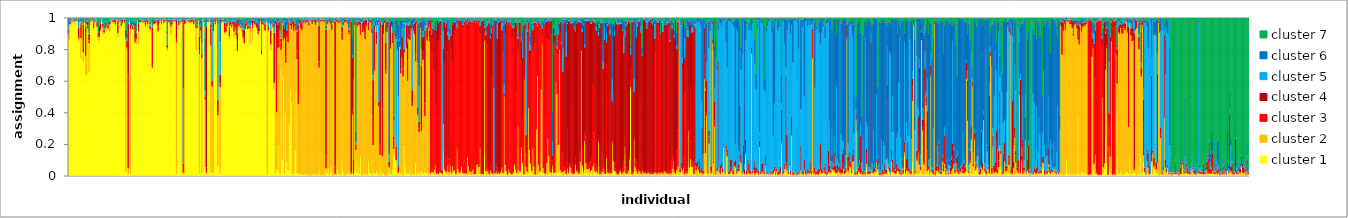
| Category | cluster 1 | cluster 2 | cluster 3 | cluster 4 | cluster 5 | cluster 6 | cluster 7 |
|---|---|---|---|---|---|---|---|
| 0 | 0.867 | 0.032 | 0.01 | 0.013 | 0.027 | 0.042 | 0.009 |
| 1 | 0.857 | 0.104 | 0.008 | 0.008 | 0.007 | 0.008 | 0.008 |
| 2 | 0.946 | 0.017 | 0.005 | 0.009 | 0.01 | 0.008 | 0.005 |
| 3 | 0.971 | 0.006 | 0.005 | 0.004 | 0.005 | 0.005 | 0.003 |
| 4 | 0.972 | 0.009 | 0.004 | 0.004 | 0.003 | 0.004 | 0.004 |
| 5 | 0.969 | 0.005 | 0.004 | 0.006 | 0.005 | 0.005 | 0.005 |
| 6 | 0.97 | 0.009 | 0.006 | 0.005 | 0.003 | 0.004 | 0.003 |
| 7 | 0.978 | 0.004 | 0.004 | 0.005 | 0.004 | 0.003 | 0.003 |
| 8 | 0.971 | 0.009 | 0.004 | 0.004 | 0.005 | 0.003 | 0.003 |
| 9 | 0.848 | 0.019 | 0.011 | 0.057 | 0.031 | 0.027 | 0.008 |
| 10 | 0.974 | 0.007 | 0.005 | 0.004 | 0.004 | 0.004 | 0.003 |
| 11 | 0.74 | 0.131 | 0.076 | 0.012 | 0.018 | 0.016 | 0.009 |
| 12 | 0.954 | 0.01 | 0.006 | 0.006 | 0.009 | 0.008 | 0.008 |
| 13 | 0.716 | 0.064 | 0.069 | 0.109 | 0.014 | 0.011 | 0.017 |
| 14 | 0.966 | 0.014 | 0.004 | 0.003 | 0.003 | 0.006 | 0.005 |
| 15 | 0.642 | 0.118 | 0.139 | 0.043 | 0.024 | 0.022 | 0.013 |
| 16 | 0.637 | 0.323 | 0.008 | 0.007 | 0.009 | 0.01 | 0.005 |
| 17 | 0.902 | 0.029 | 0.019 | 0.027 | 0.006 | 0.009 | 0.009 |
| 18 | 0.654 | 0.184 | 0.019 | 0.04 | 0.007 | 0.011 | 0.086 |
| 19 | 0.95 | 0.028 | 0.005 | 0.004 | 0.004 | 0.006 | 0.003 |
| 20 | 0.975 | 0.007 | 0.004 | 0.004 | 0.004 | 0.004 | 0.003 |
| 21 | 0.975 | 0.009 | 0.005 | 0.003 | 0.003 | 0.003 | 0.002 |
| 22 | 0.922 | 0.013 | 0.018 | 0.012 | 0.02 | 0.008 | 0.006 |
| 23 | 0.964 | 0.006 | 0.008 | 0.006 | 0.005 | 0.005 | 0.007 |
| 24 | 0.979 | 0.006 | 0.003 | 0.004 | 0.003 | 0.003 | 0.003 |
| 25 | 0.935 | 0.009 | 0.027 | 0.009 | 0.007 | 0.006 | 0.008 |
| 26 | 0.859 | 0.02 | 0.013 | 0.015 | 0.007 | 0.018 | 0.068 |
| 27 | 0.839 | 0.04 | 0.025 | 0.043 | 0.039 | 0.008 | 0.006 |
| 28 | 0.909 | 0.015 | 0.04 | 0.006 | 0.006 | 0.008 | 0.016 |
| 29 | 0.979 | 0.004 | 0.004 | 0.003 | 0.003 | 0.003 | 0.003 |
| 30 | 0.89 | 0.052 | 0.012 | 0.008 | 0.014 | 0.013 | 0.011 |
| 31 | 0.899 | 0.008 | 0.011 | 0.008 | 0.006 | 0.009 | 0.06 |
| 32 | 0.918 | 0.017 | 0.023 | 0.012 | 0.012 | 0.01 | 0.008 |
| 33 | 0.912 | 0.037 | 0.009 | 0.007 | 0.019 | 0.009 | 0.006 |
| 34 | 0.924 | 0.012 | 0.008 | 0.007 | 0.004 | 0.006 | 0.038 |
| 35 | 0.923 | 0.013 | 0.008 | 0.007 | 0.004 | 0.006 | 0.039 |
| 36 | 0.91 | 0.044 | 0.005 | 0.02 | 0.013 | 0.004 | 0.004 |
| 37 | 0.981 | 0.005 | 0.003 | 0.004 | 0.003 | 0.003 | 0.002 |
| 38 | 0.962 | 0.013 | 0.007 | 0.007 | 0.004 | 0.004 | 0.003 |
| 39 | 0.968 | 0.008 | 0.006 | 0.005 | 0.005 | 0.004 | 0.004 |
| 40 | 0.963 | 0.008 | 0.01 | 0.006 | 0.005 | 0.005 | 0.004 |
| 41 | 0.95 | 0.008 | 0.013 | 0.009 | 0.007 | 0.006 | 0.007 |
| 42 | 0.978 | 0.005 | 0.004 | 0.003 | 0.003 | 0.003 | 0.004 |
| 43 | 0.878 | 0.024 | 0.054 | 0.02 | 0.006 | 0.006 | 0.011 |
| 44 | 0.968 | 0.004 | 0.006 | 0.004 | 0.004 | 0.005 | 0.01 |
| 45 | 0.973 | 0.006 | 0.005 | 0.005 | 0.003 | 0.004 | 0.004 |
| 46 | 0.938 | 0.012 | 0.013 | 0.008 | 0.011 | 0.01 | 0.007 |
| 47 | 0.956 | 0.011 | 0.006 | 0.014 | 0.005 | 0.005 | 0.003 |
| 48 | 0.978 | 0.006 | 0.003 | 0.004 | 0.003 | 0.003 | 0.003 |
| 49 | 0.961 | 0.012 | 0.008 | 0.007 | 0.003 | 0.004 | 0.004 |
| 50 | 0.024 | 0.843 | 0.017 | 0.037 | 0.059 | 0.007 | 0.013 |
| 51 | 0.798 | 0.012 | 0.033 | 0.011 | 0.021 | 0.024 | 0.101 |
| 52 | 0.01 | 0.036 | 0.586 | 0.33 | 0.012 | 0.018 | 0.008 |
| 53 | 0.975 | 0.008 | 0.003 | 0.004 | 0.004 | 0.004 | 0.003 |
| 54 | 0.013 | 0.917 | 0.017 | 0.008 | 0.009 | 0.017 | 0.019 |
| 55 | 0.941 | 0.008 | 0.01 | 0.011 | 0.012 | 0.009 | 0.009 |
| 56 | 0.921 | 0.006 | 0.008 | 0.011 | 0.015 | 0.017 | 0.022 |
| 57 | 0.948 | 0.005 | 0.022 | 0.008 | 0.006 | 0.003 | 0.007 |
| 58 | 0.833 | 0.011 | 0.023 | 0.101 | 0.007 | 0.006 | 0.02 |
| 59 | 0.834 | 0.032 | 0.02 | 0.013 | 0.007 | 0.007 | 0.086 |
| 60 | 0.974 | 0.004 | 0.003 | 0.004 | 0.005 | 0.005 | 0.005 |
| 61 | 0.831 | 0.085 | 0.021 | 0.028 | 0.01 | 0.012 | 0.012 |
| 62 | 0.965 | 0.005 | 0.008 | 0.009 | 0.004 | 0.005 | 0.005 |
| 63 | 0.965 | 0.009 | 0.007 | 0.009 | 0.003 | 0.004 | 0.003 |
| 64 | 0.971 | 0.005 | 0.003 | 0.004 | 0.007 | 0.006 | 0.004 |
| 65 | 0.966 | 0.005 | 0.006 | 0.004 | 0.004 | 0.005 | 0.01 |
| 66 | 0.965 | 0.008 | 0.007 | 0.005 | 0.004 | 0.006 | 0.006 |
| 67 | 0.935 | 0.014 | 0.009 | 0.01 | 0.005 | 0.008 | 0.019 |
| 68 | 0.967 | 0.004 | 0.005 | 0.007 | 0.005 | 0.008 | 0.004 |
| 69 | 0.93 | 0.031 | 0.007 | 0.012 | 0.007 | 0.005 | 0.007 |
| 70 | 0.974 | 0.005 | 0.004 | 0.005 | 0.003 | 0.004 | 0.006 |
| 71 | 0.906 | 0.021 | 0.017 | 0.007 | 0.009 | 0.015 | 0.024 |
| 72 | 0.968 | 0.008 | 0.005 | 0.004 | 0.004 | 0.004 | 0.007 |
| 73 | 0.675 | 0.011 | 0.229 | 0.023 | 0.012 | 0.01 | 0.039 |
| 74 | 0.948 | 0.014 | 0.015 | 0.008 | 0.005 | 0.006 | 0.004 |
| 75 | 0.958 | 0.006 | 0.013 | 0.006 | 0.008 | 0.005 | 0.004 |
| 76 | 0.957 | 0.01 | 0.009 | 0.007 | 0.005 | 0.005 | 0.008 |
| 77 | 0.966 | 0.011 | 0.006 | 0.004 | 0.003 | 0.005 | 0.005 |
| 78 | 0.907 | 0.011 | 0.028 | 0.039 | 0.004 | 0.004 | 0.008 |
| 79 | 0.961 | 0.008 | 0.004 | 0.005 | 0.004 | 0.004 | 0.013 |
| 80 | 0.974 | 0.008 | 0.003 | 0.004 | 0.003 | 0.003 | 0.004 |
| 81 | 0.955 | 0.006 | 0.004 | 0.009 | 0.007 | 0.009 | 0.01 |
| 82 | 0.981 | 0.004 | 0.003 | 0.004 | 0.002 | 0.003 | 0.003 |
| 83 | 0.962 | 0.007 | 0.009 | 0.008 | 0.004 | 0.005 | 0.005 |
| 84 | 0.971 | 0.006 | 0.006 | 0.004 | 0.005 | 0.005 | 0.004 |
| 85 | 0.972 | 0.005 | 0.003 | 0.005 | 0.002 | 0.005 | 0.008 |
| 86 | 0.787 | 0.018 | 0.008 | 0.014 | 0.072 | 0.02 | 0.081 |
| 87 | 0.97 | 0.004 | 0.006 | 0.005 | 0.003 | 0.004 | 0.007 |
| 88 | 0.962 | 0.008 | 0.012 | 0.006 | 0.005 | 0.004 | 0.004 |
| 89 | 0.892 | 0.054 | 0.01 | 0.011 | 0.012 | 0.011 | 0.011 |
| 90 | 0.935 | 0.023 | 0.013 | 0.014 | 0.003 | 0.004 | 0.008 |
| 91 | 0.975 | 0.004 | 0.005 | 0.004 | 0.004 | 0.004 | 0.006 |
| 92 | 0.97 | 0.006 | 0.006 | 0.004 | 0.004 | 0.005 | 0.004 |
| 93 | 0.973 | 0.006 | 0.004 | 0.005 | 0.004 | 0.004 | 0.004 |
| 94 | 0.013 | 0.831 | 0.019 | 0.121 | 0.007 | 0.006 | 0.004 |
| 95 | 0.973 | 0.003 | 0.005 | 0.004 | 0.004 | 0.005 | 0.006 |
| 96 | 0.926 | 0.028 | 0.008 | 0.014 | 0.007 | 0.007 | 0.01 |
| 97 | 0.962 | 0.007 | 0.005 | 0.006 | 0.006 | 0.005 | 0.009 |
| 98 | 0.975 | 0.004 | 0.005 | 0.004 | 0.004 | 0.004 | 0.004 |
| 99 | 0.007 | 0.964 | 0.009 | 0.009 | 0.004 | 0.005 | 0.003 |
| 100 | 0.008 | 0.012 | 0.039 | 0.015 | 0.479 | 0.417 | 0.03 |
| 101 | 0.017 | 0.945 | 0.007 | 0.018 | 0.005 | 0.005 | 0.003 |
| 102 | 0.96 | 0.005 | 0.009 | 0.005 | 0.003 | 0.004 | 0.014 |
| 103 | 0.975 | 0.006 | 0.004 | 0.005 | 0.004 | 0.003 | 0.004 |
| 104 | 0.97 | 0.007 | 0.005 | 0.005 | 0.004 | 0.004 | 0.005 |
| 105 | 0.966 | 0.005 | 0.004 | 0.005 | 0.005 | 0.006 | 0.008 |
| 106 | 0.966 | 0.007 | 0.008 | 0.006 | 0.004 | 0.004 | 0.006 |
| 107 | 0.964 | 0.009 | 0.004 | 0.008 | 0.006 | 0.005 | 0.005 |
| 108 | 0.971 | 0.006 | 0.009 | 0.004 | 0.004 | 0.003 | 0.003 |
| 109 | 0.953 | 0.007 | 0.01 | 0.011 | 0.007 | 0.006 | 0.006 |
| 110 | 0.968 | 0.008 | 0.007 | 0.004 | 0.004 | 0.005 | 0.005 |
| 111 | 0.8 | 0.136 | 0.009 | 0.014 | 0.007 | 0.012 | 0.023 |
| 112 | 0.929 | 0.007 | 0.009 | 0.006 | 0.008 | 0.018 | 0.022 |
| 113 | 0.979 | 0.004 | 0.002 | 0.003 | 0.003 | 0.005 | 0.004 |
| 114 | 0.012 | 0.757 | 0.023 | 0.09 | 0.072 | 0.022 | 0.025 |
| 115 | 0.864 | 0.055 | 0.012 | 0.011 | 0.022 | 0.021 | 0.014 |
| 116 | 0.015 | 0.729 | 0.022 | 0.009 | 0.065 | 0.145 | 0.016 |
| 117 | 0.984 | 0.003 | 0.003 | 0.003 | 0.002 | 0.002 | 0.002 |
| 118 | 0.965 | 0.008 | 0.01 | 0.005 | 0.003 | 0.004 | 0.005 |
| 119 | 0.052 | 0.429 | 0.01 | 0.009 | 0.038 | 0.339 | 0.123 |
| 120 | 0.008 | 0.012 | 0.032 | 0.894 | 0.025 | 0.024 | 0.007 |
| 121 | 0.971 | 0.006 | 0.005 | 0.005 | 0.004 | 0.004 | 0.004 |
| 122 | 0.967 | 0.006 | 0.004 | 0.004 | 0.008 | 0.005 | 0.006 |
| 123 | 0.976 | 0.004 | 0.004 | 0.003 | 0.004 | 0.004 | 0.005 |
| 124 | 0.022 | 0.801 | 0.117 | 0.018 | 0.014 | 0.013 | 0.014 |
| 125 | 0.02 | 0.543 | 0.008 | 0.028 | 0.373 | 0.016 | 0.011 |
| 126 | 0.015 | 0.901 | 0.02 | 0.036 | 0.008 | 0.008 | 0.013 |
| 127 | 0.961 | 0.013 | 0.005 | 0.009 | 0.004 | 0.004 | 0.004 |
| 128 | 0.949 | 0.012 | 0.007 | 0.006 | 0.009 | 0.01 | 0.008 |
| 129 | 0.978 | 0.004 | 0.006 | 0.004 | 0.003 | 0.003 | 0.003 |
| 130 | 0.059 | 0.323 | 0.018 | 0.079 | 0.482 | 0.03 | 0.009 |
| 131 | 0.55 | 0.424 | 0.006 | 0.004 | 0.004 | 0.004 | 0.008 |
| 132 | 0.011 | 0.551 | 0.024 | 0.055 | 0.205 | 0.151 | 0.004 |
| 133 | 0.963 | 0.008 | 0.007 | 0.008 | 0.005 | 0.005 | 0.004 |
| 134 | 0.975 | 0.003 | 0.004 | 0.005 | 0.004 | 0.005 | 0.006 |
| 135 | 0.967 | 0.01 | 0.005 | 0.006 | 0.004 | 0.004 | 0.003 |
| 136 | 0.89 | 0.017 | 0.041 | 0.02 | 0.009 | 0.014 | 0.01 |
| 137 | 0.905 | 0.008 | 0.044 | 0.006 | 0.006 | 0.008 | 0.023 |
| 138 | 0.942 | 0.008 | 0.011 | 0.011 | 0.013 | 0.005 | 0.01 |
| 139 | 0.968 | 0.005 | 0.007 | 0.004 | 0.004 | 0.004 | 0.008 |
| 140 | 0.863 | 0.018 | 0.053 | 0.009 | 0.005 | 0.024 | 0.028 |
| 141 | 0.949 | 0.007 | 0.011 | 0.009 | 0.008 | 0.008 | 0.007 |
| 142 | 0.931 | 0.008 | 0.007 | 0.011 | 0.033 | 0.006 | 0.003 |
| 143 | 0.946 | 0.011 | 0.017 | 0.007 | 0.007 | 0.006 | 0.006 |
| 144 | 0.879 | 0.033 | 0.051 | 0.012 | 0.009 | 0.008 | 0.009 |
| 145 | 0.938 | 0.007 | 0.014 | 0.013 | 0.009 | 0.006 | 0.013 |
| 146 | 0.867 | 0.022 | 0.027 | 0.049 | 0.009 | 0.013 | 0.014 |
| 147 | 0.783 | 0.008 | 0.054 | 0.057 | 0.038 | 0.05 | 0.011 |
| 148 | 0.919 | 0.033 | 0.016 | 0.016 | 0.004 | 0.006 | 0.006 |
| 149 | 0.938 | 0.007 | 0.007 | 0.007 | 0.015 | 0.018 | 0.008 |
| 150 | 0.918 | 0.017 | 0.006 | 0.006 | 0.013 | 0.027 | 0.012 |
| 151 | 0.908 | 0.03 | 0.013 | 0.017 | 0.006 | 0.012 | 0.014 |
| 152 | 0.845 | 0.029 | 0.017 | 0.031 | 0.028 | 0.02 | 0.032 |
| 153 | 0.832 | 0.006 | 0.043 | 0.041 | 0.013 | 0.015 | 0.048 |
| 154 | 0.925 | 0.003 | 0.016 | 0.017 | 0.017 | 0.011 | 0.01 |
| 155 | 0.937 | 0.017 | 0.008 | 0.012 | 0.009 | 0.01 | 0.007 |
| 156 | 0.923 | 0.006 | 0.019 | 0.006 | 0.009 | 0.01 | 0.026 |
| 157 | 0.93 | 0.005 | 0.006 | 0.008 | 0.014 | 0.019 | 0.018 |
| 158 | 0.833 | 0.097 | 0.008 | 0.006 | 0.012 | 0.035 | 0.009 |
| 159 | 0.966 | 0.005 | 0.004 | 0.008 | 0.007 | 0.006 | 0.004 |
| 160 | 0.854 | 0.081 | 0.016 | 0.032 | 0.006 | 0.008 | 0.004 |
| 161 | 0.964 | 0.005 | 0.006 | 0.006 | 0.006 | 0.007 | 0.006 |
| 162 | 0.955 | 0.006 | 0.011 | 0.009 | 0.007 | 0.008 | 0.004 |
| 163 | 0.937 | 0.016 | 0.006 | 0.006 | 0.016 | 0.012 | 0.006 |
| 164 | 0.927 | 0.008 | 0.006 | 0.035 | 0.009 | 0.007 | 0.008 |
| 165 | 0.884 | 0.014 | 0.015 | 0.047 | 0.015 | 0.02 | 0.005 |
| 166 | 0.908 | 0.007 | 0.01 | 0.009 | 0.026 | 0.035 | 0.005 |
| 167 | 0.974 | 0.007 | 0.004 | 0.005 | 0.004 | 0.004 | 0.003 |
| 168 | 0.763 | 0.006 | 0.021 | 0.006 | 0.164 | 0.034 | 0.007 |
| 169 | 0.952 | 0.007 | 0.006 | 0.01 | 0.01 | 0.007 | 0.007 |
| 170 | 0.925 | 0.028 | 0.004 | 0.008 | 0.011 | 0.018 | 0.006 |
| 171 | 0.912 | 0.007 | 0.027 | 0.012 | 0.018 | 0.013 | 0.011 |
| 172 | 0.973 | 0.004 | 0.005 | 0.004 | 0.005 | 0.005 | 0.005 |
| 173 | 0.006 | 0.96 | 0.007 | 0.005 | 0.009 | 0.008 | 0.006 |
| 174 | 0.91 | 0.011 | 0.015 | 0.01 | 0.034 | 0.014 | 0.006 |
| 175 | 0.96 | 0.01 | 0.005 | 0.007 | 0.007 | 0.007 | 0.005 |
| 176 | 0.796 | 0.035 | 0.048 | 0.038 | 0.039 | 0.03 | 0.014 |
| 177 | 0.959 | 0.005 | 0.005 | 0.009 | 0.008 | 0.007 | 0.007 |
| 178 | 0.928 | 0.013 | 0.009 | 0.01 | 0.012 | 0.022 | 0.006 |
| 179 | 0.544 | 0.042 | 0.006 | 0.313 | 0.034 | 0.04 | 0.021 |
| 180 | 0.015 | 0.949 | 0.008 | 0.01 | 0.008 | 0.007 | 0.004 |
| 181 | 0.042 | 0.361 | 0.53 | 0.042 | 0.006 | 0.01 | 0.009 |
| 182 | 0.033 | 0.774 | 0.07 | 0.081 | 0.017 | 0.019 | 0.006 |
| 183 | 0.198 | 0.617 | 0.152 | 0.008 | 0.005 | 0.016 | 0.004 |
| 184 | 0.011 | 0.911 | 0.051 | 0.009 | 0.006 | 0.007 | 0.005 |
| 185 | 0.671 | 0.126 | 0.047 | 0.023 | 0.031 | 0.011 | 0.09 |
| 186 | 0.097 | 0.868 | 0.006 | 0.006 | 0.005 | 0.01 | 0.008 |
| 187 | 0.623 | 0.233 | 0.016 | 0.081 | 0.026 | 0.017 | 0.004 |
| 188 | 0.015 | 0.857 | 0.034 | 0.025 | 0.052 | 0.012 | 0.005 |
| 189 | 0.403 | 0.31 | 0.04 | 0.221 | 0.008 | 0.014 | 0.004 |
| 190 | 0.087 | 0.792 | 0.017 | 0.021 | 0.039 | 0.037 | 0.006 |
| 191 | 0.034 | 0.811 | 0.124 | 0.008 | 0.007 | 0.009 | 0.006 |
| 192 | 0.321 | 0.654 | 0.009 | 0.005 | 0.004 | 0.004 | 0.004 |
| 193 | 0.548 | 0.405 | 0.009 | 0.009 | 0.011 | 0.008 | 0.01 |
| 194 | 0.462 | 0.466 | 0.015 | 0.022 | 0.012 | 0.018 | 0.007 |
| 195 | 0.013 | 0.948 | 0.012 | 0.01 | 0.008 | 0.006 | 0.004 |
| 196 | 0.012 | 0.904 | 0.013 | 0.048 | 0.009 | 0.009 | 0.006 |
| 197 | 0.158 | 0.791 | 0.009 | 0.006 | 0.006 | 0.007 | 0.023 |
| 198 | 0.526 | 0.393 | 0.028 | 0.012 | 0.011 | 0.015 | 0.015 |
| 199 | 0.013 | 0.724 | 0.058 | 0.118 | 0.019 | 0.062 | 0.006 |
| 200 | 0.017 | 0.435 | 0.49 | 0.012 | 0.007 | 0.011 | 0.028 |
| 201 | 0.008 | 0.957 | 0.01 | 0.012 | 0.005 | 0.005 | 0.004 |
| 202 | 0.009 | 0.927 | 0.038 | 0.011 | 0.005 | 0.005 | 0.005 |
| 203 | 0.008 | 0.913 | 0.033 | 0.013 | 0.015 | 0.01 | 0.008 |
| 204 | 0.007 | 0.957 | 0.007 | 0.014 | 0.005 | 0.005 | 0.006 |
| 205 | 0.005 | 0.972 | 0.005 | 0.007 | 0.004 | 0.004 | 0.003 |
| 206 | 0.018 | 0.946 | 0.006 | 0.009 | 0.008 | 0.007 | 0.006 |
| 207 | 0.007 | 0.965 | 0.01 | 0.006 | 0.005 | 0.004 | 0.003 |
| 208 | 0.006 | 0.968 | 0.007 | 0.007 | 0.004 | 0.005 | 0.004 |
| 209 | 0.005 | 0.946 | 0.01 | 0.01 | 0.02 | 0.005 | 0.004 |
| 210 | 0.005 | 0.974 | 0.004 | 0.005 | 0.005 | 0.004 | 0.003 |
| 211 | 0.003 | 0.978 | 0.006 | 0.004 | 0.003 | 0.003 | 0.002 |
| 212 | 0.006 | 0.956 | 0.017 | 0.008 | 0.005 | 0.004 | 0.005 |
| 213 | 0.012 | 0.968 | 0.005 | 0.005 | 0.004 | 0.003 | 0.003 |
| 214 | 0.006 | 0.969 | 0.005 | 0.006 | 0.007 | 0.004 | 0.003 |
| 215 | 0.008 | 0.947 | 0.025 | 0.009 | 0.004 | 0.004 | 0.003 |
| 216 | 0.004 | 0.97 | 0.007 | 0.008 | 0.004 | 0.004 | 0.003 |
| 217 | 0.006 | 0.974 | 0.004 | 0.006 | 0.005 | 0.003 | 0.002 |
| 218 | 0.037 | 0.647 | 0.04 | 0.226 | 0.006 | 0.007 | 0.037 |
| 219 | 0.005 | 0.97 | 0.007 | 0.006 | 0.004 | 0.004 | 0.003 |
| 220 | 0.004 | 0.974 | 0.004 | 0.006 | 0.006 | 0.003 | 0.003 |
| 221 | 0.007 | 0.974 | 0.006 | 0.004 | 0.003 | 0.003 | 0.002 |
| 222 | 0.005 | 0.969 | 0.004 | 0.009 | 0.005 | 0.005 | 0.004 |
| 223 | 0.005 | 0.967 | 0.007 | 0.005 | 0.006 | 0.005 | 0.005 |
| 224 | 0.034 | 0.014 | 0.079 | 0.797 | 0.006 | 0.021 | 0.047 |
| 225 | 0.013 | 0.949 | 0.011 | 0.012 | 0.007 | 0.004 | 0.004 |
| 226 | 0.044 | 0.928 | 0.007 | 0.004 | 0.008 | 0.005 | 0.006 |
| 227 | 0.004 | 0.969 | 0.005 | 0.012 | 0.004 | 0.004 | 0.003 |
| 228 | 0.025 | 0.936 | 0.006 | 0.01 | 0.007 | 0.008 | 0.007 |
| 229 | 0.055 | 0.867 | 0.007 | 0.03 | 0.006 | 0.017 | 0.019 |
| 230 | 0.003 | 0.972 | 0.005 | 0.009 | 0.004 | 0.004 | 0.003 |
| 231 | 0.008 | 0.957 | 0.011 | 0.006 | 0.006 | 0.006 | 0.007 |
| 232 | 0.005 | 0.009 | 0.044 | 0.918 | 0.006 | 0.012 | 0.005 |
| 233 | 0.004 | 0.972 | 0.009 | 0.006 | 0.004 | 0.003 | 0.003 |
| 234 | 0.036 | 0.939 | 0.007 | 0.005 | 0.006 | 0.004 | 0.003 |
| 235 | 0.008 | 0.958 | 0.008 | 0.006 | 0.005 | 0.006 | 0.009 |
| 236 | 0.006 | 0.964 | 0.007 | 0.007 | 0.007 | 0.005 | 0.004 |
| 237 | 0.01 | 0.963 | 0.005 | 0.008 | 0.006 | 0.005 | 0.003 |
| 238 | 0.089 | 0.771 | 0.046 | 0.035 | 0.022 | 0.013 | 0.025 |
| 239 | 0.024 | 0.93 | 0.007 | 0.011 | 0.011 | 0.013 | 0.004 |
| 240 | 0.004 | 0.966 | 0.005 | 0.012 | 0.006 | 0.005 | 0.003 |
| 241 | 0.005 | 0.967 | 0.005 | 0.008 | 0.005 | 0.007 | 0.004 |
| 242 | 0.004 | 0.969 | 0.006 | 0.007 | 0.005 | 0.004 | 0.005 |
| 243 | 0.012 | 0.951 | 0.013 | 0.004 | 0.008 | 0.007 | 0.006 |
| 244 | 0.018 | 0.878 | 0.012 | 0.013 | 0.012 | 0.062 | 0.005 |
| 245 | 0.006 | 0.962 | 0.009 | 0.006 | 0.006 | 0.005 | 0.005 |
| 246 | 0.006 | 0.008 | 0.009 | 0.952 | 0.004 | 0.009 | 0.011 |
| 247 | 0.014 | 0.373 | 0.03 | 0.332 | 0.014 | 0.107 | 0.13 |
| 248 | 0.005 | 0.007 | 0.068 | 0.019 | 0.513 | 0.316 | 0.072 |
| 249 | 0.03 | 0.924 | 0.018 | 0.007 | 0.009 | 0.009 | 0.003 |
| 250 | 0.092 | 0.072 | 0.02 | 0.011 | 0.019 | 0.072 | 0.714 |
| 251 | 0.016 | 0.929 | 0.022 | 0.008 | 0.009 | 0.007 | 0.009 |
| 252 | 0.066 | 0.887 | 0.014 | 0.008 | 0.008 | 0.011 | 0.007 |
| 253 | 0.012 | 0.944 | 0.019 | 0.007 | 0.008 | 0.007 | 0.004 |
| 254 | 0.121 | 0.771 | 0.063 | 0.017 | 0.008 | 0.015 | 0.006 |
| 255 | 0.005 | 0.968 | 0.006 | 0.009 | 0.004 | 0.004 | 0.003 |
| 256 | 0.005 | 0.904 | 0.022 | 0.038 | 0.007 | 0.009 | 0.015 |
| 257 | 0.012 | 0.907 | 0.03 | 0.033 | 0.005 | 0.008 | 0.005 |
| 258 | 0.007 | 0.857 | 0.116 | 0.008 | 0.004 | 0.005 | 0.003 |
| 259 | 0.008 | 0.94 | 0.012 | 0.026 | 0.006 | 0.004 | 0.004 |
| 260 | 0.005 | 0.977 | 0.004 | 0.004 | 0.003 | 0.004 | 0.003 |
| 261 | 0.093 | 0.829 | 0.03 | 0.02 | 0.009 | 0.011 | 0.007 |
| 262 | 0.016 | 0.954 | 0.014 | 0.005 | 0.005 | 0.004 | 0.003 |
| 263 | 0.016 | 0.955 | 0.012 | 0.005 | 0.004 | 0.004 | 0.003 |
| 264 | 0.007 | 0.897 | 0.015 | 0.01 | 0.021 | 0.044 | 0.006 |
| 265 | 0.023 | 0.171 | 0.19 | 0.221 | 0.031 | 0.295 | 0.07 |
| 266 | 0.016 | 0.65 | 0.261 | 0.023 | 0.024 | 0.021 | 0.006 |
| 267 | 0.009 | 0.938 | 0.013 | 0.023 | 0.008 | 0.005 | 0.004 |
| 268 | 0.031 | 0.804 | 0.027 | 0.048 | 0.061 | 0.02 | 0.009 |
| 269 | 0.01 | 0.942 | 0.021 | 0.011 | 0.006 | 0.004 | 0.005 |
| 270 | 0.004 | 0.434 | 0.008 | 0.02 | 0.505 | 0.02 | 0.01 |
| 271 | 0.037 | 0.095 | 0.067 | 0.773 | 0.009 | 0.008 | 0.011 |
| 272 | 0.005 | 0.971 | 0.005 | 0.007 | 0.004 | 0.005 | 0.003 |
| 273 | 0.021 | 0.102 | 0.306 | 0.527 | 0.011 | 0.01 | 0.023 |
| 274 | 0.014 | 0.882 | 0.022 | 0.054 | 0.013 | 0.01 | 0.005 |
| 275 | 0.005 | 0.961 | 0.007 | 0.011 | 0.007 | 0.006 | 0.004 |
| 276 | 0.007 | 0.639 | 0.021 | 0.174 | 0.07 | 0.05 | 0.04 |
| 277 | 0.004 | 0.907 | 0.014 | 0.053 | 0.008 | 0.008 | 0.006 |
| 278 | 0.016 | 0.926 | 0.014 | 0.019 | 0.007 | 0.007 | 0.01 |
| 279 | 0.045 | 0.007 | 0.01 | 0.026 | 0.046 | 0.822 | 0.044 |
| 280 | 0.008 | 0.796 | 0.019 | 0.147 | 0.006 | 0.015 | 0.01 |
| 281 | 0.007 | 0.938 | 0.011 | 0.024 | 0.009 | 0.006 | 0.005 |
| 282 | 0.035 | 0.805 | 0.053 | 0.013 | 0.026 | 0.057 | 0.011 |
| 283 | 0.13 | 0.039 | 0.057 | 0.024 | 0.098 | 0.033 | 0.619 |
| 284 | 0.242 | 0.64 | 0.027 | 0.01 | 0.036 | 0.033 | 0.012 |
| 285 | 0.085 | 0.014 | 0.072 | 0.014 | 0.678 | 0.121 | 0.016 |
| 286 | 0.009 | 0.792 | 0.008 | 0.044 | 0.033 | 0.107 | 0.007 |
| 287 | 0.015 | 0.005 | 0.033 | 0.01 | 0.441 | 0.452 | 0.045 |
| 288 | 0.033 | 0.784 | 0.014 | 0.019 | 0.02 | 0.019 | 0.111 |
| 289 | 0.011 | 0.636 | 0.025 | 0.131 | 0.02 | 0.163 | 0.015 |
| 290 | 0.013 | 0.735 | 0.052 | 0.077 | 0.048 | 0.061 | 0.013 |
| 291 | 0.004 | 0.624 | 0.055 | 0.243 | 0.038 | 0.027 | 0.009 |
| 292 | 0.196 | 0.582 | 0.009 | 0.012 | 0.131 | 0.032 | 0.038 |
| 293 | 0.055 | 0.911 | 0.008 | 0.009 | 0.004 | 0.005 | 0.008 |
| 294 | 0.015 | 0.79 | 0.029 | 0.123 | 0.016 | 0.013 | 0.015 |
| 295 | 0.009 | 0.593 | 0.127 | 0.115 | 0.027 | 0.077 | 0.052 |
| 296 | 0.011 | 0.852 | 0.029 | 0.056 | 0.026 | 0.019 | 0.006 |
| 297 | 0.033 | 0.826 | 0.074 | 0.024 | 0.014 | 0.008 | 0.022 |
| 298 | 0.005 | 0.921 | 0.015 | 0.043 | 0.005 | 0.007 | 0.004 |
| 299 | 0.01 | 0.43 | 0.015 | 0.086 | 0.393 | 0.056 | 0.011 |
| 300 | 0.005 | 0.912 | 0.014 | 0.022 | 0.016 | 0.024 | 0.006 |
| 301 | 0.013 | 0.884 | 0.048 | 0.018 | 0.013 | 0.016 | 0.008 |
| 302 | 0.079 | 0.648 | 0.041 | 0.208 | 0.011 | 0.009 | 0.004 |
| 303 | 0.007 | 0.955 | 0.009 | 0.012 | 0.005 | 0.006 | 0.005 |
| 304 | 0.012 | 0.369 | 0.008 | 0.046 | 0.277 | 0.251 | 0.039 |
| 305 | 0.025 | 0.25 | 0.027 | 0.04 | 0.224 | 0.404 | 0.03 |
| 306 | 0.008 | 0.929 | 0.012 | 0.023 | 0.006 | 0.016 | 0.006 |
| 307 | 0.034 | 0.25 | 0.037 | 0.377 | 0.102 | 0.177 | 0.022 |
| 308 | 0.015 | 0.718 | 0.052 | 0.094 | 0.036 | 0.069 | 0.016 |
| 309 | 0.015 | 0.719 | 0.053 | 0.092 | 0.036 | 0.07 | 0.016 |
| 310 | 0.021 | 0.357 | 0.082 | 0.458 | 0.032 | 0.034 | 0.017 |
| 311 | 0.012 | 0.94 | 0.011 | 0.009 | 0.006 | 0.012 | 0.009 |
| 312 | 0.026 | 0.83 | 0.012 | 0.07 | 0.04 | 0.009 | 0.014 |
| 313 | 0.007 | 0.926 | 0.009 | 0.039 | 0.007 | 0.008 | 0.004 |
| 314 | 0.015 | 0.834 | 0.026 | 0.045 | 0.036 | 0.025 | 0.019 |
| 315 | 0.008 | 0.008 | 0.954 | 0.016 | 0.006 | 0.005 | 0.004 |
| 316 | 0.009 | 0.016 | 0.758 | 0.112 | 0.008 | 0.008 | 0.09 |
| 317 | 0.012 | 0.009 | 0.845 | 0.071 | 0.025 | 0.005 | 0.031 |
| 318 | 0.006 | 0.033 | 0.621 | 0.266 | 0.012 | 0.015 | 0.048 |
| 319 | 0.034 | 0.031 | 0.896 | 0.015 | 0.013 | 0.006 | 0.005 |
| 320 | 0.007 | 0.007 | 0.441 | 0.466 | 0.008 | 0.016 | 0.056 |
| 321 | 0.008 | 0.008 | 0.832 | 0.136 | 0.006 | 0.004 | 0.004 |
| 322 | 0.006 | 0.004 | 0.841 | 0.115 | 0.008 | 0.008 | 0.018 |
| 323 | 0.018 | 0.007 | 0.929 | 0.025 | 0.005 | 0.005 | 0.011 |
| 324 | 0.012 | 0.006 | 0.866 | 0.098 | 0.005 | 0.005 | 0.008 |
| 325 | 0.004 | 0.009 | 0.016 | 0.008 | 0.948 | 0.009 | 0.006 |
| 326 | 0.154 | 0.174 | 0.397 | 0.078 | 0.111 | 0.061 | 0.025 |
| 327 | 0.03 | 0.01 | 0.667 | 0.271 | 0.006 | 0.008 | 0.007 |
| 328 | 0.015 | 0.011 | 0.786 | 0.133 | 0.041 | 0.009 | 0.005 |
| 329 | 0.007 | 0.02 | 0.087 | 0.852 | 0.014 | 0.008 | 0.012 |
| 330 | 0.032 | 0.035 | 0.714 | 0.111 | 0.016 | 0.079 | 0.013 |
| 331 | 0.004 | 0.019 | 0.081 | 0.757 | 0.107 | 0.022 | 0.01 |
| 332 | 0.04 | 0.027 | 0.808 | 0.011 | 0.007 | 0.043 | 0.062 |
| 333 | 0.004 | 0.014 | 0.792 | 0.081 | 0.048 | 0.007 | 0.055 |
| 334 | 0.008 | 0.052 | 0.67 | 0.228 | 0.008 | 0.007 | 0.028 |
| 335 | 0.015 | 0.017 | 0.86 | 0.083 | 0.006 | 0.007 | 0.013 |
| 336 | 0.022 | 0.013 | 0.881 | 0.055 | 0.006 | 0.02 | 0.004 |
| 337 | 0.004 | 0.006 | 0.963 | 0.007 | 0.01 | 0.006 | 0.004 |
| 338 | 0.159 | 0.015 | 0.757 | 0.007 | 0.023 | 0.031 | 0.008 |
| 339 | 0.019 | 0.023 | 0.94 | 0.006 | 0.004 | 0.005 | 0.004 |
| 340 | 0.009 | 0.011 | 0.955 | 0.009 | 0.006 | 0.005 | 0.005 |
| 341 | 0.01 | 0.016 | 0.927 | 0.026 | 0.007 | 0.006 | 0.008 |
| 342 | 0.045 | 0.013 | 0.921 | 0.007 | 0.003 | 0.005 | 0.006 |
| 343 | 0.01 | 0.007 | 0.917 | 0.02 | 0.016 | 0.014 | 0.016 |
| 344 | 0.009 | 0.005 | 0.944 | 0.018 | 0.007 | 0.013 | 0.004 |
| 345 | 0.005 | 0.011 | 0.952 | 0.011 | 0.005 | 0.006 | 0.009 |
| 346 | 0.006 | 0.008 | 0.964 | 0.008 | 0.004 | 0.005 | 0.004 |
| 347 | 0.009 | 0.106 | 0.807 | 0.037 | 0.015 | 0.02 | 0.008 |
| 348 | 0.01 | 0.05 | 0.896 | 0.021 | 0.006 | 0.006 | 0.011 |
| 349 | 0.008 | 0.02 | 0.941 | 0.012 | 0.006 | 0.007 | 0.006 |
| 350 | 0.006 | 0.017 | 0.953 | 0.006 | 0.004 | 0.01 | 0.004 |
| 351 | 0.006 | 0.027 | 0.926 | 0.011 | 0.007 | 0.008 | 0.014 |
| 352 | 0.01 | 0.033 | 0.932 | 0.008 | 0.005 | 0.007 | 0.005 |
| 353 | 0.004 | 0.005 | 0.969 | 0.007 | 0.006 | 0.005 | 0.004 |
| 354 | 0.006 | 0.006 | 0.953 | 0.007 | 0.017 | 0.005 | 0.006 |
| 355 | 0.007 | 0.061 | 0.905 | 0.012 | 0.005 | 0.005 | 0.005 |
| 356 | 0.041 | 0.031 | 0.9 | 0.006 | 0.006 | 0.007 | 0.01 |
| 357 | 0.009 | 0.046 | 0.913 | 0.019 | 0.004 | 0.006 | 0.004 |
| 358 | 0.008 | 0.165 | 0.726 | 0.051 | 0.018 | 0.01 | 0.022 |
| 359 | 0.006 | 0.006 | 0.957 | 0.005 | 0.007 | 0.007 | 0.012 |
| 360 | 0.006 | 0.007 | 0.016 | 0.953 | 0.005 | 0.005 | 0.008 |
| 361 | 0.005 | 0.005 | 0.954 | 0.019 | 0.007 | 0.005 | 0.005 |
| 362 | 0.141 | 0.712 | 0.049 | 0.034 | 0.012 | 0.014 | 0.038 |
| 363 | 0.012 | 0.016 | 0.826 | 0.035 | 0.027 | 0.026 | 0.058 |
| 364 | 0.003 | 0.033 | 0.794 | 0.118 | 0.028 | 0.016 | 0.008 |
| 365 | 0.013 | 0.011 | 0.016 | 0.93 | 0.016 | 0.008 | 0.006 |
| 366 | 0.004 | 0.006 | 0.021 | 0.934 | 0.021 | 0.011 | 0.004 |
| 367 | 0.006 | 0.028 | 0.029 | 0.807 | 0.014 | 0.07 | 0.046 |
| 368 | 0.007 | 0.013 | 0.616 | 0.266 | 0.028 | 0.049 | 0.02 |
| 369 | 0.006 | 0.006 | 0.936 | 0.006 | 0.024 | 0.006 | 0.016 |
| 370 | 0.008 | 0.012 | 0.004 | 0.006 | 0.525 | 0.432 | 0.013 |
| 371 | 0.007 | 0.007 | 0.005 | 0.97 | 0.004 | 0.004 | 0.003 |
| 372 | 0.014 | 0.014 | 0.049 | 0.901 | 0.012 | 0.005 | 0.005 |
| 373 | 0.006 | 0.007 | 0.041 | 0.815 | 0.095 | 0.022 | 0.013 |
| 374 | 0.01 | 0.01 | 0.007 | 0.943 | 0.014 | 0.011 | 0.005 |
| 375 | 0.006 | 0.005 | 0.007 | 0.955 | 0.005 | 0.007 | 0.016 |
| 376 | 0.009 | 0.012 | 0.008 | 0.957 | 0.005 | 0.005 | 0.004 |
| 377 | 0.04 | 0.011 | 0.841 | 0.028 | 0.046 | 0.013 | 0.02 |
| 378 | 0.007 | 0.011 | 0.764 | 0.167 | 0.019 | 0.015 | 0.017 |
| 379 | 0.011 | 0.49 | 0.008 | 0.01 | 0.06 | 0.411 | 0.009 |
| 380 | 0.036 | 0.032 | 0.824 | 0.071 | 0.02 | 0.01 | 0.007 |
| 381 | 0.009 | 0.019 | 0.929 | 0.026 | 0.004 | 0.005 | 0.007 |
| 382 | 0.003 | 0.005 | 0.951 | 0.008 | 0.012 | 0.006 | 0.016 |
| 383 | 0.013 | 0.027 | 0.923 | 0.011 | 0.006 | 0.011 | 0.008 |
| 384 | 0.016 | 0.005 | 0.944 | 0.011 | 0.009 | 0.006 | 0.01 |
| 385 | 0.004 | 0.006 | 0.949 | 0.008 | 0.012 | 0.011 | 0.009 |
| 386 | 0.006 | 0.006 | 0.862 | 0.065 | 0.005 | 0.006 | 0.05 |
| 387 | 0.015 | 0.009 | 0.893 | 0.013 | 0.016 | 0.021 | 0.032 |
| 388 | 0.061 | 0.011 | 0.835 | 0.036 | 0.011 | 0.023 | 0.023 |
| 389 | 0.026 | 0.013 | 0.492 | 0.438 | 0.013 | 0.007 | 0.011 |
| 390 | 0.008 | 0.01 | 0.942 | 0.01 | 0.01 | 0.007 | 0.012 |
| 391 | 0.159 | 0.158 | 0.485 | 0.064 | 0.016 | 0.016 | 0.103 |
| 392 | 0.011 | 0.021 | 0.847 | 0.093 | 0.006 | 0.006 | 0.017 |
| 393 | 0.019 | 0.008 | 0.934 | 0.007 | 0.006 | 0.009 | 0.016 |
| 394 | 0.149 | 0.032 | 0.543 | 0.129 | 0.029 | 0.019 | 0.1 |
| 395 | 0.062 | 0.02 | 0.291 | 0.374 | 0.104 | 0.069 | 0.08 |
| 396 | 0.004 | 0.005 | 0.942 | 0.005 | 0.009 | 0.008 | 0.027 |
| 397 | 0.008 | 0.597 | 0.01 | 0.356 | 0.006 | 0.013 | 0.01 |
| 398 | 0.023 | 0.032 | 0.082 | 0.121 | 0.668 | 0.036 | 0.036 |
| 399 | 0.008 | 0.019 | 0.858 | 0.027 | 0.056 | 0.022 | 0.01 |
| 400 | 0.013 | 0.416 | 0.498 | 0.046 | 0.013 | 0.008 | 0.007 |
| 401 | 0.125 | 0.039 | 0.526 | 0.101 | 0.059 | 0.03 | 0.119 |
| 402 | 0.05 | 0.026 | 0.693 | 0.027 | 0.029 | 0.08 | 0.094 |
| 403 | 0.013 | 0.016 | 0.919 | 0.013 | 0.011 | 0.013 | 0.015 |
| 404 | 0.161 | 0.013 | 0.626 | 0.123 | 0.028 | 0.017 | 0.03 |
| 405 | 0.005 | 0.052 | 0.783 | 0.127 | 0.013 | 0.01 | 0.01 |
| 406 | 0.004 | 0.005 | 0.941 | 0.021 | 0.01 | 0.012 | 0.008 |
| 407 | 0.004 | 0.289 | 0.665 | 0.007 | 0.01 | 0.008 | 0.016 |
| 408 | 0.005 | 0.628 | 0.279 | 0.032 | 0.029 | 0.014 | 0.012 |
| 409 | 0.011 | 0.059 | 0.901 | 0.008 | 0.005 | 0.008 | 0.008 |
| 410 | 0.019 | 0.011 | 0.92 | 0.017 | 0.007 | 0.008 | 0.018 |
| 411 | 0.144 | 0.401 | 0.388 | 0.021 | 0.008 | 0.009 | 0.029 |
| 412 | 0.024 | 0.806 | 0.062 | 0.04 | 0.021 | 0.03 | 0.018 |
| 413 | 0.011 | 0.037 | 0.919 | 0.007 | 0.005 | 0.008 | 0.012 |
| 414 | 0.003 | 0.014 | 0.929 | 0.012 | 0.016 | 0.017 | 0.008 |
| 415 | 0.004 | 0.01 | 0.931 | 0.028 | 0.009 | 0.009 | 0.009 |
| 416 | 0.011 | 0.068 | 0.785 | 0.112 | 0.005 | 0.012 | 0.007 |
| 417 | 0.006 | 0.231 | 0.731 | 0.015 | 0.005 | 0.007 | 0.005 |
| 418 | 0.044 | 0.082 | 0.727 | 0.125 | 0.005 | 0.006 | 0.011 |
| 419 | 0.014 | 0.009 | 0.943 | 0.014 | 0.006 | 0.007 | 0.008 |
| 420 | 0.003 | 0.017 | 0.873 | 0.086 | 0.01 | 0.006 | 0.004 |
| 421 | 0.036 | 0.028 | 0.036 | 0.028 | 0.088 | 0.194 | 0.59 |
| 422 | 0.013 | 0.007 | 0.804 | 0.115 | 0.016 | 0.03 | 0.017 |
| 423 | 0.011 | 0.009 | 0.818 | 0.052 | 0.009 | 0.03 | 0.071 |
| 424 | 0.018 | 0.573 | 0.267 | 0.049 | 0.009 | 0.012 | 0.072 |
| 425 | 0.027 | 0.489 | 0.253 | 0.036 | 0.014 | 0.051 | 0.13 |
| 426 | 0.017 | 0.179 | 0.661 | 0.038 | 0.036 | 0.04 | 0.029 |
| 427 | 0.027 | 0.772 | 0.146 | 0.015 | 0.015 | 0.012 | 0.012 |
| 428 | 0.016 | 0.021 | 0.871 | 0.067 | 0.006 | 0.006 | 0.011 |
| 429 | 0.01 | 0.014 | 0.735 | 0.073 | 0.013 | 0.116 | 0.039 |
| 430 | 0.006 | 0.018 | 0.124 | 0.51 | 0.153 | 0.177 | 0.012 |
| 431 | 0.007 | 0.022 | 0.021 | 0.916 | 0.012 | 0.012 | 0.009 |
| 432 | 0.015 | 0.022 | 0.014 | 0.935 | 0.006 | 0.005 | 0.003 |
| 433 | 0.005 | 0.006 | 0.076 | 0.668 | 0.158 | 0.073 | 0.014 |
| 434 | 0.023 | 0.024 | 0.251 | 0.665 | 0.006 | 0.017 | 0.014 |
| 435 | 0.009 | 0.009 | 0.01 | 0.953 | 0.004 | 0.01 | 0.005 |
| 436 | 0.034 | 0.027 | 0.015 | 0.898 | 0.006 | 0.01 | 0.01 |
| 437 | 0.012 | 0.037 | 0.023 | 0.891 | 0.007 | 0.014 | 0.017 |
| 438 | 0.005 | 0.011 | 0.39 | 0.562 | 0.013 | 0.009 | 0.011 |
| 439 | 0.005 | 0.006 | 0.015 | 0.943 | 0.018 | 0.009 | 0.004 |
| 440 | 0.007 | 0.009 | 0.046 | 0.87 | 0.011 | 0.038 | 0.019 |
| 441 | 0.053 | 0.018 | 0.046 | 0.797 | 0.017 | 0.057 | 0.012 |
| 442 | 0.013 | 0.015 | 0.005 | 0.933 | 0.005 | 0.015 | 0.013 |
| 443 | 0.009 | 0.016 | 0.016 | 0.941 | 0.009 | 0.006 | 0.003 |
| 444 | 0.006 | 0.006 | 0.013 | 0.946 | 0.013 | 0.011 | 0.005 |
| 445 | 0.023 | 0.066 | 0.048 | 0.839 | 0.008 | 0.011 | 0.004 |
| 446 | 0.007 | 0.784 | 0.136 | 0.039 | 0.012 | 0.013 | 0.008 |
| 447 | 0.048 | 0.016 | 0.106 | 0.742 | 0.014 | 0.061 | 0.013 |
| 448 | 0.007 | 0.015 | 0.013 | 0.919 | 0.008 | 0.029 | 0.011 |
| 449 | 0.033 | 0.185 | 0.051 | 0.544 | 0.017 | 0.149 | 0.022 |
| 450 | 0.014 | 0.068 | 0.165 | 0.736 | 0.005 | 0.01 | 0.003 |
| 451 | 0.016 | 0.026 | 0.027 | 0.912 | 0.005 | 0.01 | 0.004 |
| 452 | 0.016 | 0.026 | 0.026 | 0.912 | 0.005 | 0.01 | 0.004 |
| 453 | 0.005 | 0.043 | 0.032 | 0.9 | 0.006 | 0.011 | 0.004 |
| 454 | 0.012 | 0.017 | 0.062 | 0.873 | 0.006 | 0.009 | 0.02 |
| 455 | 0.032 | 0.005 | 0.081 | 0.844 | 0.01 | 0.007 | 0.021 |
| 456 | 0.006 | 0.052 | 0.516 | 0.406 | 0.007 | 0.006 | 0.007 |
| 457 | 0.064 | 0.014 | 0.196 | 0.702 | 0.008 | 0.005 | 0.012 |
| 458 | 0.017 | 0.009 | 0.527 | 0.416 | 0.006 | 0.009 | 0.017 |
| 459 | 0.016 | 0.02 | 0.036 | 0.847 | 0.021 | 0.024 | 0.036 |
| 460 | 0.006 | 0.015 | 0.034 | 0.925 | 0.008 | 0.006 | 0.007 |
| 461 | 0.011 | 0.204 | 0.038 | 0.631 | 0.025 | 0.009 | 0.081 |
| 462 | 0.005 | 0.005 | 0.044 | 0.882 | 0.023 | 0.027 | 0.014 |
| 463 | 0.004 | 0.009 | 0.015 | 0.939 | 0.017 | 0.007 | 0.008 |
| 464 | 0.008 | 0.017 | 0.116 | 0.829 | 0.006 | 0.007 | 0.017 |
| 465 | 0.038 | 0.014 | 0.544 | 0.082 | 0.046 | 0.243 | 0.034 |
| 466 | 0.01 | 0.009 | 0.021 | 0.822 | 0.073 | 0.037 | 0.027 |
| 467 | 0.006 | 0.005 | 0.02 | 0.94 | 0.007 | 0.01 | 0.013 |
| 468 | 0.01 | 0.102 | 0.596 | 0.135 | 0.06 | 0.074 | 0.022 |
| 469 | 0.009 | 0.011 | 0.019 | 0.908 | 0.012 | 0.018 | 0.022 |
| 470 | 0.005 | 0.011 | 0.009 | 0.936 | 0.02 | 0.015 | 0.005 |
| 471 | 0.007 | 0.012 | 0.501 | 0.375 | 0.029 | 0.049 | 0.027 |
| 472 | 0.008 | 0.007 | 0.024 | 0.927 | 0.012 | 0.011 | 0.01 |
| 473 | 0.012 | 0.195 | 0.01 | 0.254 | 0.139 | 0.349 | 0.042 |
| 474 | 0.027 | 0.066 | 0.449 | 0.419 | 0.021 | 0.013 | 0.005 |
| 475 | 0.022 | 0.011 | 0.045 | 0.809 | 0.027 | 0.037 | 0.049 |
| 476 | 0.009 | 0.017 | 0.019 | 0.933 | 0.01 | 0.007 | 0.004 |
| 477 | 0.004 | 0.007 | 0.009 | 0.943 | 0.02 | 0.014 | 0.004 |
| 478 | 0.003 | 0.005 | 0.004 | 0.944 | 0.01 | 0.028 | 0.005 |
| 479 | 0.005 | 0.017 | 0.012 | 0.929 | 0.008 | 0.018 | 0.011 |
| 480 | 0.019 | 0.013 | 0.011 | 0.917 | 0.014 | 0.009 | 0.018 |
| 481 | 0.006 | 0.007 | 0.013 | 0.936 | 0.01 | 0.022 | 0.006 |
| 482 | 0.006 | 0.014 | 0.036 | 0.859 | 0.01 | 0.059 | 0.017 |
| 483 | 0.006 | 0.019 | 0.064 | 0.688 | 0.109 | 0.093 | 0.023 |
| 484 | 0.135 | 0.049 | 0.064 | 0.636 | 0.034 | 0.064 | 0.017 |
| 485 | 0.006 | 0.006 | 0.043 | 0.896 | 0.008 | 0.019 | 0.023 |
| 486 | 0.007 | 0.011 | 0.017 | 0.925 | 0.019 | 0.011 | 0.01 |
| 487 | 0.014 | 0.017 | 0.007 | 0.941 | 0.005 | 0.007 | 0.008 |
| 488 | 0.005 | 0.097 | 0.024 | 0.84 | 0.008 | 0.007 | 0.02 |
| 489 | 0.546 | 0.017 | 0.109 | 0.095 | 0.039 | 0.016 | 0.177 |
| 490 | 0.003 | 0.008 | 0.014 | 0.952 | 0.007 | 0.011 | 0.005 |
| 491 | 0.004 | 0.009 | 0.006 | 0.956 | 0.011 | 0.009 | 0.004 |
| 492 | 0.029 | 0.201 | 0.022 | 0.28 | 0.081 | 0.379 | 0.008 |
| 493 | 0.016 | 0.037 | 0.052 | 0.871 | 0.005 | 0.012 | 0.007 |
| 494 | 0.007 | 0.024 | 0.058 | 0.788 | 0.1 | 0.012 | 0.01 |
| 495 | 0.008 | 0.007 | 0.025 | 0.903 | 0.02 | 0.016 | 0.022 |
| 496 | 0.007 | 0.02 | 0.013 | 0.937 | 0.008 | 0.006 | 0.01 |
| 497 | 0.005 | 0.025 | 0.445 | 0.501 | 0.008 | 0.008 | 0.008 |
| 498 | 0.006 | 0.007 | 0.007 | 0.887 | 0.039 | 0.051 | 0.003 |
| 499 | 0.004 | 0.032 | 0.014 | 0.711 | 0.008 | 0.044 | 0.186 |
| 500 | 0.005 | 0.011 | 0.007 | 0.965 | 0.005 | 0.004 | 0.003 |
| 501 | 0.005 | 0.014 | 0.007 | 0.963 | 0.004 | 0.003 | 0.003 |
| 502 | 0.008 | 0.01 | 0.01 | 0.948 | 0.009 | 0.009 | 0.006 |
| 503 | 0.005 | 0.004 | 0.005 | 0.918 | 0.046 | 0.013 | 0.01 |
| 504 | 0.009 | 0.012 | 0.01 | 0.942 | 0.01 | 0.009 | 0.007 |
| 505 | 0.007 | 0.006 | 0.007 | 0.96 | 0.008 | 0.006 | 0.006 |
| 506 | 0.003 | 0.01 | 0.008 | 0.966 | 0.003 | 0.005 | 0.004 |
| 507 | 0.006 | 0.007 | 0.909 | 0.044 | 0.009 | 0.013 | 0.013 |
| 508 | 0.004 | 0.006 | 0.011 | 0.933 | 0.02 | 0.019 | 0.007 |
| 509 | 0.008 | 0.005 | 0.006 | 0.956 | 0.007 | 0.013 | 0.005 |
| 510 | 0.008 | 0.011 | 0.759 | 0.089 | 0.094 | 0.025 | 0.014 |
| 511 | 0.006 | 0.013 | 0.936 | 0.031 | 0.005 | 0.005 | 0.004 |
| 512 | 0.004 | 0.004 | 0.008 | 0.954 | 0.017 | 0.008 | 0.005 |
| 513 | 0.008 | 0.015 | 0.932 | 0.013 | 0.01 | 0.007 | 0.016 |
| 514 | 0.004 | 0.012 | 0.915 | 0.048 | 0.008 | 0.009 | 0.003 |
| 515 | 0.005 | 0.014 | 0.872 | 0.009 | 0.007 | 0.008 | 0.085 |
| 516 | 0.007 | 0.01 | 0.005 | 0.949 | 0.013 | 0.01 | 0.005 |
| 517 | 0.007 | 0.006 | 0.006 | 0.893 | 0.066 | 0.011 | 0.013 |
| 518 | 0.008 | 0.025 | 0.878 | 0.044 | 0.006 | 0.007 | 0.031 |
| 519 | 0.005 | 0.016 | 0.007 | 0.955 | 0.008 | 0.006 | 0.004 |
| 520 | 0.005 | 0.013 | 0.01 | 0.928 | 0.022 | 0.019 | 0.004 |
| 521 | 0.007 | 0.007 | 0.938 | 0.012 | 0.023 | 0.008 | 0.006 |
| 522 | 0.004 | 0.01 | 0.919 | 0.038 | 0.01 | 0.012 | 0.007 |
| 523 | 0.005 | 0.009 | 0.017 | 0.817 | 0.011 | 0.109 | 0.032 |
| 524 | 0.005 | 0.008 | 0.082 | 0.89 | 0.006 | 0.005 | 0.005 |
| 525 | 0.009 | 0.035 | 0.151 | 0.736 | 0.022 | 0.02 | 0.027 |
| 526 | 0.01 | 0.083 | 0.032 | 0.846 | 0.011 | 0.011 | 0.007 |
| 527 | 0.012 | 0.013 | 0.014 | 0.837 | 0.015 | 0.033 | 0.075 |
| 528 | 0.004 | 0.008 | 0.011 | 0.965 | 0.005 | 0.004 | 0.003 |
| 529 | 0.014 | 0.023 | 0.122 | 0.641 | 0.025 | 0.078 | 0.097 |
| 530 | 0.014 | 0.044 | 0.227 | 0.691 | 0.012 | 0.008 | 0.005 |
| 531 | 0.004 | 0.975 | 0.003 | 0.006 | 0.003 | 0.005 | 0.003 |
| 532 | 0.013 | 0.009 | 0.02 | 0.007 | 0.94 | 0.006 | 0.005 |
| 533 | 0.029 | 0.021 | 0.013 | 0.019 | 0.87 | 0.041 | 0.006 |
| 534 | 0.009 | 0.025 | 0.635 | 0.044 | 0.039 | 0.198 | 0.05 |
| 535 | 0.006 | 0.043 | 0.068 | 0.867 | 0.007 | 0.005 | 0.003 |
| 536 | 0.005 | 0.007 | 0.504 | 0.23 | 0.127 | 0.062 | 0.065 |
| 537 | 0.004 | 0.014 | 0.719 | 0.22 | 0.007 | 0.025 | 0.01 |
| 538 | 0.005 | 0.01 | 0.013 | 0.853 | 0.069 | 0.042 | 0.009 |
| 539 | 0.094 | 0.189 | 0.056 | 0.537 | 0.044 | 0.059 | 0.021 |
| 540 | 0.018 | 0.033 | 0.023 | 0.902 | 0.012 | 0.008 | 0.005 |
| 541 | 0.059 | 0.045 | 0.452 | 0.402 | 0.009 | 0.022 | 0.012 |
| 542 | 0.048 | 0.009 | 0.159 | 0.689 | 0.033 | 0.031 | 0.03 |
| 543 | 0.024 | 0.032 | 0.019 | 0.836 | 0.023 | 0.057 | 0.008 |
| 544 | 0.003 | 0.007 | 0.241 | 0.704 | 0.022 | 0.009 | 0.013 |
| 545 | 0.018 | 0.045 | 0.03 | 0.845 | 0.023 | 0.024 | 0.016 |
| 546 | 0.007 | 0.029 | 0.022 | 0.025 | 0.902 | 0.01 | 0.005 |
| 547 | 0.005 | 0.049 | 0.013 | 0.026 | 0.873 | 0.028 | 0.005 |
| 548 | 0.026 | 0.016 | 0.009 | 0.006 | 0.922 | 0.012 | 0.009 |
| 549 | 0.004 | 0.01 | 0.056 | 0.035 | 0.871 | 0.017 | 0.007 |
| 550 | 0.013 | 0.008 | 0.007 | 0.013 | 0.911 | 0.041 | 0.008 |
| 551 | 0.004 | 0.01 | 0.02 | 0.27 | 0.166 | 0.52 | 0.008 |
| 552 | 0.006 | 0.008 | 0.01 | 0.009 | 0.104 | 0.859 | 0.005 |
| 553 | 0.009 | 0.603 | 0.15 | 0.174 | 0.021 | 0.026 | 0.017 |
| 554 | 0.015 | 0.128 | 0.257 | 0.138 | 0.015 | 0.413 | 0.034 |
| 555 | 0.023 | 0.358 | 0.017 | 0.205 | 0.117 | 0.246 | 0.034 |
| 556 | 0.004 | 0.011 | 0.006 | 0.007 | 0.955 | 0.009 | 0.008 |
| 557 | 0.013 | 0.19 | 0.045 | 0.038 | 0.523 | 0.174 | 0.018 |
| 558 | 0.004 | 0.911 | 0.041 | 0.017 | 0.01 | 0.012 | 0.005 |
| 559 | 0.012 | 0.004 | 0.011 | 0.032 | 0.914 | 0.018 | 0.007 |
| 560 | 0.018 | 0.821 | 0.009 | 0.011 | 0.099 | 0.019 | 0.022 |
| 561 | 0.004 | 0.077 | 0.009 | 0.007 | 0.693 | 0.192 | 0.018 |
| 562 | 0.008 | 0.303 | 0.038 | 0.121 | 0.087 | 0.268 | 0.175 |
| 563 | 0.004 | 0.004 | 0.005 | 0.005 | 0.728 | 0.248 | 0.006 |
| 564 | 0.017 | 0.012 | 0.007 | 0.014 | 0.622 | 0.016 | 0.312 |
| 565 | 0.005 | 0.043 | 0.022 | 0.657 | 0.197 | 0.06 | 0.016 |
| 566 | 0.016 | 0.01 | 0.004 | 0.006 | 0.945 | 0.015 | 0.004 |
| 567 | 0.005 | 0.008 | 0.019 | 0.034 | 0.899 | 0.03 | 0.005 |
| 568 | 0.029 | 0.021 | 0.013 | 0.019 | 0.871 | 0.04 | 0.006 |
| 569 | 0.013 | 0.009 | 0.02 | 0.007 | 0.941 | 0.005 | 0.005 |
| 570 | 0.176 | 0.005 | 0.009 | 0.013 | 0.772 | 0.019 | 0.006 |
| 571 | 0.004 | 0.007 | 0.003 | 0.005 | 0.966 | 0.01 | 0.004 |
| 572 | 0.111 | 0.047 | 0.011 | 0.026 | 0.654 | 0.127 | 0.023 |
| 573 | 0.021 | 0.101 | 0.022 | 0.02 | 0.52 | 0.304 | 0.013 |
| 574 | 0.006 | 0.004 | 0.004 | 0.011 | 0.955 | 0.016 | 0.004 |
| 575 | 0.004 | 0.008 | 0.006 | 0.006 | 0.957 | 0.015 | 0.005 |
| 576 | 0.009 | 0.015 | 0.028 | 0.049 | 0.868 | 0.023 | 0.007 |
| 577 | 0.025 | 0.011 | 0.074 | 0.006 | 0.865 | 0.014 | 0.005 |
| 578 | 0.004 | 0.005 | 0.015 | 0.011 | 0.918 | 0.026 | 0.021 |
| 579 | 0.009 | 0.053 | 0.007 | 0.02 | 0.851 | 0.042 | 0.018 |
| 580 | 0.044 | 0.009 | 0.008 | 0.037 | 0.103 | 0.793 | 0.006 |
| 581 | 0.009 | 0.007 | 0.006 | 0.005 | 0.899 | 0.066 | 0.008 |
| 582 | 0.006 | 0.021 | 0.01 | 0.007 | 0.863 | 0.085 | 0.007 |
| 583 | 0.02 | 0.012 | 0.015 | 0.027 | 0.082 | 0.838 | 0.006 |
| 584 | 0.019 | 0.07 | 0.15 | 0.207 | 0.34 | 0.168 | 0.046 |
| 585 | 0.056 | 0.023 | 0.033 | 0.017 | 0.54 | 0.143 | 0.187 |
| 586 | 0.005 | 0.007 | 0.004 | 0.007 | 0.748 | 0.225 | 0.005 |
| 587 | 0.015 | 0.011 | 0.012 | 0.155 | 0.785 | 0.012 | 0.01 |
| 588 | 0.004 | 0.008 | 0.011 | 0.018 | 0.033 | 0.916 | 0.01 |
| 589 | 0.099 | 0.039 | 0.011 | 0.078 | 0.632 | 0.132 | 0.009 |
| 590 | 0.006 | 0.004 | 0.022 | 0.008 | 0.921 | 0.015 | 0.024 |
| 591 | 0.013 | 0.021 | 0.045 | 0.025 | 0.88 | 0.009 | 0.006 |
| 592 | 0.005 | 0.012 | 0.052 | 0.009 | 0.843 | 0.039 | 0.039 |
| 593 | 0.005 | 0.004 | 0.008 | 0.015 | 0.924 | 0.014 | 0.032 |
| 594 | 0.011 | 0.763 | 0.02 | 0.017 | 0.103 | 0.08 | 0.006 |
| 595 | 0.005 | 0.011 | 0.006 | 0.011 | 0.931 | 0.018 | 0.019 |
| 596 | 0.016 | 0.021 | 0.01 | 0.006 | 0.93 | 0.009 | 0.008 |
| 597 | 0.003 | 0.005 | 0.009 | 0.08 | 0.612 | 0.159 | 0.13 |
| 598 | 0.015 | 0.007 | 0.011 | 0.018 | 0.492 | 0.101 | 0.356 |
| 599 | 0.015 | 0.01 | 0.008 | 0.009 | 0.894 | 0.027 | 0.038 |
| 600 | 0.005 | 0.003 | 0.007 | 0.015 | 0.954 | 0.014 | 0.003 |
| 601 | 0.011 | 0.17 | 0.015 | 0.027 | 0.052 | 0.698 | 0.028 |
| 602 | 0.006 | 0.005 | 0.009 | 0.007 | 0.96 | 0.008 | 0.006 |
| 603 | 0.01 | 0.009 | 0.01 | 0.047 | 0.89 | 0.024 | 0.01 |
| 604 | 0.014 | 0.009 | 0.015 | 0.047 | 0.87 | 0.032 | 0.013 |
| 605 | 0.006 | 0.005 | 0.009 | 0.008 | 0.519 | 0.413 | 0.039 |
| 606 | 0.045 | 0.019 | 0.019 | 0.042 | 0.406 | 0.081 | 0.388 |
| 607 | 0.004 | 0.005 | 0.006 | 0.004 | 0.893 | 0.025 | 0.063 |
| 608 | 0.006 | 0.009 | 0.006 | 0.007 | 0.919 | 0.031 | 0.022 |
| 609 | 0.004 | 0.003 | 0.004 | 0.004 | 0.96 | 0.02 | 0.005 |
| 610 | 0.005 | 0.003 | 0.004 | 0.005 | 0.967 | 0.01 | 0.007 |
| 611 | 0.006 | 0.007 | 0.009 | 0.011 | 0.952 | 0.009 | 0.006 |
| 612 | 0.005 | 0.005 | 0.006 | 0.006 | 0.882 | 0.084 | 0.013 |
| 613 | 0.007 | 0.007 | 0.017 | 0.008 | 0.213 | 0.688 | 0.061 |
| 614 | 0.023 | 0.007 | 0.016 | 0.012 | 0.399 | 0.52 | 0.022 |
| 615 | 0.003 | 0.003 | 0.004 | 0.007 | 0.958 | 0.018 | 0.007 |
| 616 | 0.016 | 0.011 | 0.008 | 0.011 | 0.939 | 0.009 | 0.007 |
| 617 | 0.003 | 0.003 | 0.014 | 0.006 | 0.891 | 0.075 | 0.008 |
| 618 | 0.004 | 0.006 | 0.007 | 0.014 | 0.909 | 0.055 | 0.006 |
| 619 | 0.003 | 0.01 | 0.013 | 0.031 | 0.888 | 0.01 | 0.045 |
| 620 | 0.15 | 0.054 | 0.012 | 0.2 | 0.042 | 0.182 | 0.36 |
| 621 | 0.003 | 0.003 | 0.005 | 0.004 | 0.966 | 0.01 | 0.009 |
| 622 | 0.008 | 0.008 | 0.012 | 0.006 | 0.944 | 0.013 | 0.01 |
| 623 | 0.019 | 0.023 | 0.02 | 0.013 | 0.76 | 0.158 | 0.008 |
| 624 | 0.024 | 0.045 | 0.012 | 0.559 | 0.044 | 0.308 | 0.007 |
| 625 | 0.017 | 0.021 | 0.044 | 0.176 | 0.66 | 0.071 | 0.01 |
| 626 | 0.005 | 0.006 | 0.009 | 0.006 | 0.96 | 0.011 | 0.004 |
| 627 | 0.049 | 0.019 | 0.007 | 0.008 | 0.885 | 0.022 | 0.009 |
| 628 | 0.005 | 0.006 | 0.011 | 0.008 | 0.866 | 0.093 | 0.011 |
| 629 | 0.024 | 0.23 | 0.017 | 0.106 | 0.578 | 0.037 | 0.007 |
| 630 | 0.003 | 0.005 | 0.011 | 0.007 | 0.689 | 0.279 | 0.006 |
| 631 | 0.004 | 0.003 | 0.005 | 0.005 | 0.966 | 0.013 | 0.004 |
| 632 | 0.007 | 0.017 | 0.01 | 0.014 | 0.932 | 0.014 | 0.006 |
| 633 | 0.002 | 0.003 | 0.004 | 0.004 | 0.978 | 0.006 | 0.003 |
| 634 | 0.003 | 0.004 | 0.005 | 0.007 | 0.951 | 0.021 | 0.009 |
| 635 | 0.009 | 0.005 | 0.005 | 0.006 | 0.779 | 0.179 | 0.018 |
| 636 | 0.003 | 0.004 | 0.004 | 0.004 | 0.978 | 0.005 | 0.003 |
| 637 | 0.018 | 0.015 | 0.116 | 0.044 | 0.227 | 0.568 | 0.012 |
| 638 | 0.005 | 0.004 | 0.005 | 0.008 | 0.918 | 0.048 | 0.01 |
| 639 | 0.005 | 0.005 | 0.013 | 0.009 | 0.931 | 0.026 | 0.011 |
| 640 | 0.016 | 0.017 | 0.011 | 0.056 | 0.404 | 0.491 | 0.006 |
| 641 | 0.004 | 0.007 | 0.008 | 0.012 | 0.945 | 0.022 | 0.003 |
| 642 | 0.004 | 0.004 | 0.004 | 0.004 | 0.966 | 0.01 | 0.006 |
| 643 | 0.006 | 0.007 | 0.011 | 0.017 | 0.906 | 0.048 | 0.005 |
| 644 | 0.003 | 0.013 | 0.007 | 0.009 | 0.945 | 0.016 | 0.008 |
| 645 | 0.012 | 0.011 | 0.012 | 0.056 | 0.862 | 0.041 | 0.006 |
| 646 | 0.003 | 0.007 | 0.014 | 0.006 | 0.944 | 0.021 | 0.005 |
| 647 | 0.014 | 0.729 | 0.17 | 0.017 | 0.028 | 0.036 | 0.006 |
| 648 | 0.007 | 0.003 | 0.005 | 0.005 | 0.963 | 0.009 | 0.007 |
| 649 | 0.004 | 0.014 | 0.022 | 0.01 | 0.505 | 0.411 | 0.034 |
| 650 | 0.004 | 0.004 | 0.012 | 0.007 | 0.89 | 0.076 | 0.007 |
| 651 | 0.006 | 0.005 | 0.013 | 0.008 | 0.899 | 0.011 | 0.057 |
| 652 | 0.003 | 0.004 | 0.03 | 0.009 | 0.933 | 0.016 | 0.005 |
| 653 | 0.012 | 0.008 | 0.006 | 0.017 | 0.859 | 0.073 | 0.024 |
| 654 | 0.01 | 0.024 | 0.036 | 0.129 | 0.631 | 0.156 | 0.014 |
| 655 | 0.013 | 0.005 | 0.013 | 0.012 | 0.863 | 0.048 | 0.048 |
| 656 | 0.011 | 0.005 | 0.008 | 0.007 | 0.91 | 0.054 | 0.006 |
| 657 | 0.024 | 0.006 | 0.009 | 0.015 | 0.923 | 0.017 | 0.007 |
| 658 | 0.007 | 0.006 | 0.047 | 0.02 | 0.788 | 0.082 | 0.049 |
| 659 | 0.003 | 0.005 | 0.007 | 0.005 | 0.943 | 0.022 | 0.014 |
| 660 | 0.003 | 0.006 | 0.007 | 0.008 | 0.943 | 0.026 | 0.006 |
| 661 | 0.016 | 0.007 | 0.054 | 0.081 | 0.817 | 0.019 | 0.006 |
| 662 | 0.01 | 0.014 | 0.018 | 0.022 | 0.281 | 0.632 | 0.023 |
| 663 | 0.011 | 0.008 | 0.011 | 0.007 | 0.055 | 0.905 | 0.004 |
| 664 | 0.03 | 0.012 | 0.047 | 0.043 | 0.157 | 0.635 | 0.077 |
| 665 | 0.021 | 0.013 | 0.007 | 0.013 | 0.028 | 0.905 | 0.013 |
| 666 | 0.023 | 0.012 | 0.092 | 0.015 | 0.106 | 0.744 | 0.007 |
| 667 | 0.009 | 0.009 | 0.009 | 0.034 | 0.062 | 0.869 | 0.008 |
| 668 | 0.012 | 0.007 | 0.009 | 0.012 | 0.528 | 0.331 | 0.102 |
| 669 | 0.004 | 0.017 | 0.023 | 0.025 | 0.033 | 0.89 | 0.007 |
| 670 | 0.021 | 0.013 | 0.007 | 0.013 | 0.029 | 0.904 | 0.013 |
| 671 | 0.008 | 0.009 | 0.08 | 0.009 | 0.86 | 0.029 | 0.005 |
| 672 | 0.006 | 0.007 | 0.009 | 0.021 | 0.218 | 0.701 | 0.038 |
| 673 | 0.008 | 0.009 | 0.06 | 0.061 | 0.085 | 0.759 | 0.017 |
| 674 | 0.012 | 0.032 | 0.105 | 0.02 | 0.042 | 0.784 | 0.005 |
| 675 | 0.004 | 0.007 | 0.005 | 0.015 | 0.026 | 0.93 | 0.013 |
| 676 | 0.008 | 0.012 | 0.017 | 0.012 | 0.08 | 0.865 | 0.006 |
| 677 | 0.075 | 0.791 | 0.015 | 0.076 | 0.024 | 0.008 | 0.01 |
| 678 | 0.003 | 0.025 | 0.063 | 0.031 | 0.083 | 0.757 | 0.037 |
| 679 | 0.018 | 0.043 | 0.038 | 0.051 | 0.794 | 0.044 | 0.011 |
| 680 | 0.047 | 0.007 | 0.025 | 0.011 | 0.867 | 0.02 | 0.022 |
| 681 | 0.004 | 0.013 | 0.007 | 0.011 | 0.929 | 0.02 | 0.015 |
| 682 | 0.016 | 0.071 | 0.033 | 0.011 | 0.746 | 0.103 | 0.02 |
| 683 | 0.037 | 0.054 | 0.053 | 0.019 | 0.102 | 0.691 | 0.043 |
| 684 | 0.002 | 0.003 | 0.003 | 0.013 | 0.919 | 0.054 | 0.006 |
| 685 | 0.35 | 0.007 | 0.011 | 0.019 | 0.031 | 0.083 | 0.498 |
| 686 | 0.004 | 0.003 | 0.019 | 0.006 | 0.245 | 0.689 | 0.034 |
| 687 | 0.016 | 0.011 | 0.018 | 0.006 | 0.018 | 0.904 | 0.027 |
| 688 | 0.012 | 0.013 | 0.014 | 0.033 | 0.026 | 0.897 | 0.005 |
| 689 | 0.005 | 0.007 | 0.064 | 0.175 | 0.07 | 0.586 | 0.092 |
| 690 | 0.007 | 0.013 | 0.005 | 0.01 | 0.05 | 0.292 | 0.623 |
| 691 | 0.004 | 0.004 | 0.013 | 0.01 | 0.192 | 0.668 | 0.109 |
| 692 | 0.012 | 0.007 | 0.005 | 0.004 | 0.007 | 0.957 | 0.006 |
| 693 | 0.003 | 0.004 | 0.005 | 0.009 | 0.854 | 0.103 | 0.022 |
| 694 | 0.052 | 0.022 | 0.063 | 0.032 | 0.17 | 0.612 | 0.049 |
| 695 | 0.005 | 0.006 | 0.006 | 0.006 | 0.293 | 0.676 | 0.009 |
| 696 | 0.004 | 0.006 | 0.005 | 0.01 | 0.027 | 0.933 | 0.014 |
| 697 | 0.005 | 0.005 | 0.005 | 0.016 | 0.02 | 0.942 | 0.008 |
| 698 | 0.012 | 0.025 | 0.051 | 0.756 | 0.06 | 0.069 | 0.027 |
| 699 | 0.013 | 0.007 | 0.005 | 0.004 | 0.054 | 0.873 | 0.046 |
| 700 | 0.01 | 0.008 | 0.051 | 0.023 | 0.192 | 0.678 | 0.039 |
| 701 | 0.01 | 0.017 | 0.01 | 0.01 | 0.036 | 0.913 | 0.006 |
| 702 | 0.018 | 0.005 | 0.004 | 0.008 | 0.011 | 0.949 | 0.005 |
| 703 | 0.019 | 0.068 | 0.006 | 0.005 | 0.411 | 0.48 | 0.01 |
| 704 | 0.025 | 0.015 | 0.019 | 0.059 | 0.007 | 0.438 | 0.437 |
| 705 | 0.003 | 0.004 | 0.007 | 0.006 | 0.057 | 0.905 | 0.018 |
| 706 | 0.003 | 0.003 | 0.006 | 0.006 | 0.014 | 0.935 | 0.033 |
| 707 | 0.002 | 0.003 | 0.006 | 0.005 | 0.21 | 0.746 | 0.027 |
| 708 | 0.005 | 0.007 | 0.014 | 0.012 | 0.033 | 0.918 | 0.01 |
| 709 | 0.005 | 0.004 | 0.012 | 0.005 | 0.187 | 0.772 | 0.015 |
| 710 | 0.005 | 0.013 | 0.012 | 0.044 | 0.115 | 0.78 | 0.032 |
| 711 | 0.007 | 0.006 | 0.01 | 0.016 | 0.06 | 0.889 | 0.013 |
| 712 | 0.004 | 0.106 | 0.361 | 0.105 | 0.242 | 0.137 | 0.046 |
| 713 | 0.034 | 0.015 | 0.007 | 0.005 | 0.015 | 0.898 | 0.026 |
| 714 | 0.02 | 0.005 | 0.009 | 0.016 | 0.735 | 0.184 | 0.033 |
| 715 | 0.004 | 0.003 | 0.005 | 0.004 | 0.751 | 0.188 | 0.044 |
| 716 | 0.019 | 0.07 | 0.032 | 0.041 | 0.113 | 0.718 | 0.007 |
| 717 | 0.015 | 0.009 | 0.05 | 0.025 | 0.406 | 0.489 | 0.006 |
| 718 | 0.008 | 0.014 | 0.019 | 0.012 | 0.225 | 0.715 | 0.009 |
| 719 | 0.006 | 0.005 | 0.006 | 0.014 | 0.011 | 0.952 | 0.006 |
| 720 | 0.006 | 0.014 | 0.028 | 0.029 | 0.16 | 0.759 | 0.004 |
| 721 | 0.028 | 0.007 | 0.013 | 0.005 | 0.219 | 0.63 | 0.097 |
| 722 | 0.023 | 0.007 | 0.012 | 0.006 | 0.543 | 0.393 | 0.015 |
| 723 | 0.006 | 0.006 | 0.009 | 0.02 | 0.837 | 0.061 | 0.061 |
| 724 | 0.002 | 0.006 | 0.005 | 0.008 | 0.221 | 0.748 | 0.008 |
| 725 | 0.007 | 0.044 | 0.013 | 0.036 | 0.007 | 0.879 | 0.013 |
| 726 | 0.008 | 0.004 | 0.008 | 0.016 | 0.009 | 0.939 | 0.015 |
| 727 | 0.125 | 0.023 | 0.051 | 0.017 | 0.632 | 0.059 | 0.092 |
| 728 | 0.004 | 0.01 | 0.017 | 0.013 | 0.171 | 0.777 | 0.007 |
| 729 | 0.02 | 0.012 | 0.016 | 0.058 | 0.233 | 0.64 | 0.021 |
| 730 | 0.006 | 0.027 | 0.017 | 0.167 | 0.035 | 0.741 | 0.007 |
| 731 | 0.013 | 0.011 | 0.006 | 0.019 | 0.928 | 0.01 | 0.013 |
| 732 | 0.007 | 0.008 | 0.009 | 0.01 | 0.825 | 0.119 | 0.022 |
| 733 | 0.005 | 0.008 | 0.006 | 0.009 | 0.203 | 0.76 | 0.009 |
| 734 | 0.087 | 0.386 | 0.092 | 0.05 | 0.045 | 0.296 | 0.045 |
| 735 | 0.005 | 0.949 | 0.02 | 0.015 | 0.003 | 0.005 | 0.003 |
| 736 | 0.007 | 0.011 | 0.008 | 0.007 | 0.253 | 0.584 | 0.13 |
| 737 | 0.007 | 0.968 | 0.006 | 0.009 | 0.004 | 0.003 | 0.003 |
| 738 | 0.013 | 0.082 | 0.014 | 0.049 | 0.597 | 0.238 | 0.007 |
| 739 | 0.01 | 0.138 | 0.099 | 0.128 | 0.055 | 0.565 | 0.005 |
| 740 | 0.012 | 0.059 | 0.086 | 0.527 | 0.052 | 0.258 | 0.008 |
| 741 | 0.03 | 0.008 | 0.011 | 0.008 | 0.081 | 0.848 | 0.013 |
| 742 | 0.014 | 0.844 | 0.018 | 0.032 | 0.016 | 0.036 | 0.041 |
| 743 | 0.009 | 0.276 | 0.022 | 0.048 | 0.074 | 0.567 | 0.004 |
| 744 | 0.006 | 0.064 | 0.013 | 0.806 | 0.058 | 0.046 | 0.007 |
| 745 | 0.01 | 0.494 | 0.087 | 0.086 | 0.111 | 0.118 | 0.095 |
| 746 | 0.025 | 0.42 | 0.016 | 0.042 | 0.029 | 0.414 | 0.053 |
| 747 | 0.009 | 0.022 | 0.13 | 0.248 | 0.202 | 0.385 | 0.005 |
| 748 | 0.035 | 0.005 | 0.008 | 0.011 | 0.039 | 0.801 | 0.103 |
| 749 | 0.003 | 0.003 | 0.003 | 0.005 | 0.091 | 0.875 | 0.02 |
| 750 | 0.017 | 0.613 | 0.01 | 0.063 | 0.072 | 0.186 | 0.039 |
| 751 | 0.013 | 0.011 | 0.006 | 0.012 | 0.009 | 0.691 | 0.258 |
| 752 | 0.004 | 0.005 | 0.009 | 0.017 | 0.264 | 0.579 | 0.123 |
| 753 | 0.007 | 0.954 | 0.012 | 0.008 | 0.005 | 0.006 | 0.008 |
| 754 | 0.003 | 0.003 | 0.011 | 0.006 | 0.007 | 0.942 | 0.027 |
| 755 | 0.015 | 0.013 | 0.019 | 0.015 | 0.009 | 0.899 | 0.029 |
| 756 | 0.01 | 0.025 | 0.015 | 0.009 | 0.133 | 0.796 | 0.012 |
| 757 | 0.012 | 0.013 | 0.12 | 0.06 | 0.007 | 0.75 | 0.038 |
| 758 | 0.006 | 0.008 | 0.01 | 0.005 | 0.034 | 0.933 | 0.005 |
| 759 | 0.006 | 0.005 | 0.006 | 0.008 | 0.006 | 0.956 | 0.013 |
| 760 | 0.018 | 0.073 | 0.023 | 0.007 | 0.011 | 0.848 | 0.02 |
| 761 | 0.022 | 0.006 | 0.028 | 0.015 | 0.008 | 0.698 | 0.223 |
| 762 | 0.021 | 0.055 | 0.162 | 0.015 | 0.056 | 0.638 | 0.054 |
| 763 | 0.004 | 0.004 | 0.008 | 0.005 | 0.026 | 0.939 | 0.013 |
| 764 | 0.024 | 0.006 | 0.009 | 0.05 | 0.011 | 0.891 | 0.009 |
| 765 | 0.005 | 0.005 | 0.008 | 0.004 | 0.05 | 0.923 | 0.005 |
| 766 | 0.036 | 0.029 | 0.013 | 0.017 | 0.008 | 0.863 | 0.035 |
| 767 | 0.007 | 0.005 | 0.018 | 0.022 | 0.01 | 0.916 | 0.021 |
| 768 | 0.008 | 0.021 | 0.055 | 0.017 | 0.022 | 0.834 | 0.044 |
| 769 | 0.009 | 0.036 | 0.077 | 0.082 | 0.649 | 0.102 | 0.044 |
| 770 | 0.028 | 0.043 | 0.031 | 0.061 | 0.015 | 0.808 | 0.015 |
| 771 | 0.009 | 0.007 | 0.008 | 0.012 | 0.041 | 0.893 | 0.03 |
| 772 | 0.02 | 0.061 | 0.013 | 0.019 | 0.009 | 0.705 | 0.174 |
| 773 | 0.008 | 0.019 | 0.044 | 0.054 | 0.032 | 0.477 | 0.366 |
| 774 | 0.005 | 0.009 | 0.013 | 0.01 | 0.012 | 0.937 | 0.015 |
| 775 | 0.008 | 0.007 | 0.004 | 0.005 | 0.008 | 0.963 | 0.005 |
| 776 | 0.008 | 0.016 | 0.012 | 0.013 | 0.013 | 0.929 | 0.01 |
| 777 | 0.017 | 0.024 | 0.006 | 0.012 | 0.019 | 0.915 | 0.007 |
| 778 | 0.008 | 0.007 | 0.024 | 0.043 | 0.193 | 0.719 | 0.005 |
| 779 | 0.011 | 0.007 | 0.015 | 0.042 | 0.026 | 0.878 | 0.02 |
| 780 | 0.021 | 0.007 | 0.005 | 0.014 | 0.02 | 0.909 | 0.023 |
| 781 | 0.018 | 0.596 | 0.045 | 0.054 | 0.019 | 0.234 | 0.034 |
| 782 | 0.022 | 0.326 | 0.214 | 0.04 | 0.066 | 0.23 | 0.101 |
| 783 | 0.008 | 0.011 | 0.006 | 0.007 | 0.035 | 0.899 | 0.035 |
| 784 | 0.068 | 0.013 | 0.014 | 0.066 | 0.01 | 0.688 | 0.141 |
| 785 | 0.009 | 0.22 | 0.082 | 0.01 | 0.468 | 0.202 | 0.009 |
| 786 | 0.013 | 0.553 | 0.01 | 0.018 | 0.026 | 0.067 | 0.313 |
| 787 | 0.053 | 0.007 | 0.008 | 0.008 | 0.07 | 0.092 | 0.76 |
| 788 | 0.008 | 0.222 | 0.016 | 0.023 | 0.026 | 0.699 | 0.006 |
| 789 | 0.03 | 0.006 | 0.011 | 0.014 | 0.031 | 0.885 | 0.023 |
| 790 | 0.048 | 0.01 | 0.006 | 0.008 | 0.047 | 0.828 | 0.053 |
| 791 | 0.021 | 0.108 | 0.008 | 0.011 | 0.02 | 0.825 | 0.007 |
| 792 | 0.003 | 0.007 | 0.009 | 0.007 | 0.023 | 0.941 | 0.01 |
| 793 | 0.007 | 0.004 | 0.008 | 0.025 | 0.018 | 0.933 | 0.003 |
| 794 | 0.027 | 0.025 | 0.014 | 0.211 | 0.011 | 0.704 | 0.008 |
| 795 | 0.008 | 0.032 | 0.013 | 0.027 | 0.2 | 0.677 | 0.043 |
| 796 | 0.021 | 0.33 | 0.024 | 0.014 | 0.018 | 0.584 | 0.009 |
| 797 | 0.021 | 0.005 | 0.008 | 0.012 | 0.031 | 0.912 | 0.011 |
| 798 | 0.004 | 0.006 | 0.007 | 0.014 | 0.768 | 0.195 | 0.007 |
| 799 | 0.011 | 0.144 | 0.02 | 0.016 | 0.009 | 0.789 | 0.01 |
| 800 | 0.013 | 0.026 | 0.006 | 0.011 | 0.015 | 0.922 | 0.008 |
| 801 | 0.007 | 0.01 | 0.025 | 0.462 | 0.086 | 0.109 | 0.302 |
| 802 | 0.004 | 0.754 | 0.014 | 0.012 | 0.032 | 0.092 | 0.092 |
| 803 | 0.007 | 0.006 | 0.008 | 0.028 | 0.64 | 0.263 | 0.048 |
| 804 | 0.01 | 0.173 | 0.011 | 0.06 | 0.047 | 0.662 | 0.037 |
| 805 | 0.01 | 0.009 | 0.009 | 0.037 | 0.438 | 0.488 | 0.008 |
| 806 | 0.004 | 0.018 | 0.041 | 0.022 | 0.714 | 0.184 | 0.017 |
| 807 | 0.011 | 0.013 | 0.185 | 0.077 | 0.379 | 0.18 | 0.155 |
| 808 | 0.008 | 0.007 | 0.013 | 0.009 | 0.132 | 0.799 | 0.032 |
| 809 | 0.012 | 0.042 | 0.044 | 0.06 | 0.758 | 0.062 | 0.022 |
| 810 | 0.039 | 0.153 | 0.119 | 0.226 | 0.089 | 0.134 | 0.24 |
| 811 | 0.054 | 0.082 | 0.014 | 0.009 | 0.499 | 0.326 | 0.017 |
| 812 | 0.004 | 0.007 | 0.008 | 0.006 | 0.503 | 0.118 | 0.354 |
| 813 | 0.007 | 0.01 | 0.041 | 0.082 | 0.193 | 0.649 | 0.018 |
| 814 | 0.008 | 0.083 | 0.038 | 0.079 | 0.145 | 0.624 | 0.023 |
| 815 | 0.008 | 0.021 | 0.009 | 0.026 | 0.009 | 0.92 | 0.007 |
| 816 | 0.012 | 0.02 | 0.013 | 0.016 | 0.47 | 0.44 | 0.029 |
| 817 | 0.023 | 0.92 | 0.015 | 0.016 | 0.014 | 0.007 | 0.005 |
| 818 | 0.017 | 0.051 | 0.044 | 0.018 | 0.779 | 0.076 | 0.014 |
| 819 | 0.006 | 0.884 | 0.009 | 0.043 | 0.027 | 0.025 | 0.006 |
| 820 | 0.005 | 0.011 | 0.027 | 0.011 | 0.895 | 0.044 | 0.008 |
| 821 | 0.006 | 0.009 | 0.029 | 0.43 | 0.409 | 0.105 | 0.012 |
| 822 | 0.038 | 0.011 | 0.007 | 0.032 | 0.097 | 0.664 | 0.151 |
| 823 | 0.008 | 0.231 | 0.028 | 0.038 | 0.394 | 0.288 | 0.013 |
| 824 | 0.008 | 0.075 | 0.044 | 0.031 | 0.383 | 0.447 | 0.011 |
| 825 | 0.02 | 0.013 | 0.01 | 0.01 | 0.003 | 0.016 | 0.927 |
| 826 | 0.007 | 0.012 | 0.034 | 0.046 | 0.841 | 0.022 | 0.039 |
| 827 | 0.014 | 0.5 | 0.012 | 0.008 | 0.082 | 0.232 | 0.15 |
| 828 | 0.005 | 0.01 | 0.011 | 0.581 | 0.043 | 0.301 | 0.049 |
| 829 | 0.04 | 0.056 | 0.009 | 0.02 | 0.049 | 0.789 | 0.037 |
| 830 | 0.007 | 0.006 | 0.197 | 0.02 | 0.269 | 0.463 | 0.039 |
| 831 | 0.006 | 0.021 | 0.006 | 0.018 | 0.044 | 0.895 | 0.01 |
| 832 | 0.016 | 0.205 | 0.007 | 0.146 | 0.136 | 0.482 | 0.008 |
| 833 | 0.008 | 0.003 | 0.005 | 0.003 | 0.007 | 0.008 | 0.965 |
| 834 | 0.02 | 0.013 | 0.056 | 0.013 | 0.077 | 0.689 | 0.132 |
| 835 | 0.004 | 0.017 | 0.018 | 0.153 | 0.033 | 0.688 | 0.088 |
| 836 | 0.002 | 0.016 | 0.009 | 0.005 | 0.005 | 0.004 | 0.957 |
| 837 | 0.006 | 0.004 | 0.004 | 0.003 | 0.008 | 0.011 | 0.964 |
| 838 | 0.004 | 0.004 | 0.004 | 0.004 | 0.955 | 0.022 | 0.006 |
| 839 | 0.006 | 0.005 | 0.006 | 0.01 | 0.492 | 0.409 | 0.073 |
| 840 | 0.016 | 0.007 | 0.026 | 0.007 | 0.405 | 0.432 | 0.107 |
| 841 | 0.007 | 0.007 | 0.006 | 0.018 | 0.062 | 0.882 | 0.019 |
| 842 | 0.006 | 0.009 | 0.019 | 0.015 | 0.384 | 0.435 | 0.132 |
| 843 | 0.005 | 0.02 | 0.062 | 0.019 | 0.04 | 0.822 | 0.032 |
| 844 | 0.006 | 0.006 | 0.004 | 0.009 | 0.335 | 0.625 | 0.014 |
| 845 | 0.009 | 0.01 | 0.006 | 0.01 | 0.225 | 0.623 | 0.117 |
| 846 | 0.01 | 0.006 | 0.007 | 0.009 | 0.021 | 0.933 | 0.013 |
| 847 | 0.034 | 0.048 | 0.026 | 0.009 | 0.157 | 0.231 | 0.496 |
| 848 | 0.045 | 0.036 | 0.022 | 0.018 | 0.54 | 0.321 | 0.018 |
| 849 | 0.004 | 0.004 | 0.01 | 0.018 | 0.158 | 0.764 | 0.042 |
| 850 | 0.005 | 0.005 | 0.005 | 0.006 | 0.095 | 0.867 | 0.017 |
| 851 | 0.005 | 0.005 | 0.005 | 0.016 | 0.097 | 0.863 | 0.009 |
| 852 | 0.042 | 0.03 | 0.048 | 0.054 | 0.324 | 0.492 | 0.01 |
| 853 | 0.016 | 0.006 | 0.015 | 0.02 | 0.013 | 0.87 | 0.059 |
| 854 | 0.006 | 0.007 | 0.006 | 0.011 | 0.194 | 0.554 | 0.221 |
| 855 | 0.014 | 0.013 | 0.007 | 0.008 | 0.06 | 0.89 | 0.008 |
| 856 | 0.009 | 0.015 | 0.007 | 0.008 | 0.014 | 0.94 | 0.007 |
| 857 | 0.014 | 0.029 | 0.024 | 0.012 | 0.13 | 0.78 | 0.012 |
| 858 | 0.01 | 0.01 | 0.007 | 0.005 | 0.026 | 0.931 | 0.01 |
| 859 | 0.004 | 0.005 | 0.006 | 0.005 | 0.128 | 0.802 | 0.049 |
| 860 | 0.016 | 0.006 | 0.007 | 0.006 | 0.406 | 0.445 | 0.113 |
| 861 | 0.005 | 0.009 | 0.005 | 0.006 | 0.01 | 0.957 | 0.007 |
| 862 | 0.011 | 0.011 | 0.006 | 0.007 | 0.259 | 0.093 | 0.613 |
| 863 | 0.007 | 0.946 | 0.02 | 0.007 | 0.005 | 0.007 | 0.008 |
| 864 | 0.019 | 0.747 | 0.173 | 0.038 | 0.005 | 0.011 | 0.007 |
| 865 | 0.005 | 0.91 | 0.01 | 0.045 | 0.006 | 0.021 | 0.003 |
| 866 | 0.005 | 0.956 | 0.005 | 0.023 | 0.003 | 0.004 | 0.003 |
| 867 | 0.014 | 0.91 | 0.031 | 0.013 | 0.007 | 0.007 | 0.018 |
| 868 | 0.095 | 0.877 | 0.005 | 0.005 | 0.006 | 0.01 | 0.004 |
| 869 | 0.011 | 0.964 | 0.004 | 0.007 | 0.004 | 0.005 | 0.004 |
| 870 | 0.011 | 0.964 | 0.004 | 0.007 | 0.004 | 0.005 | 0.004 |
| 871 | 0.01 | 0.949 | 0.016 | 0.01 | 0.006 | 0.004 | 0.005 |
| 872 | 0.006 | 0.954 | 0.015 | 0.01 | 0.005 | 0.007 | 0.004 |
| 873 | 0.008 | 0.925 | 0.006 | 0.043 | 0.004 | 0.007 | 0.007 |
| 874 | 0.006 | 0.879 | 0.008 | 0.009 | 0.033 | 0.045 | 0.02 |
| 875 | 0.009 | 0.946 | 0.012 | 0.012 | 0.01 | 0.006 | 0.003 |
| 876 | 0.006 | 0.953 | 0.011 | 0.014 | 0.004 | 0.006 | 0.005 |
| 877 | 0.007 | 0.926 | 0.01 | 0.014 | 0.007 | 0.026 | 0.011 |
| 878 | 0.371 | 0.491 | 0.057 | 0.056 | 0.01 | 0.007 | 0.009 |
| 879 | 0.008 | 0.823 | 0.079 | 0.036 | 0.018 | 0.021 | 0.017 |
| 880 | 0.007 | 0.948 | 0.014 | 0.014 | 0.005 | 0.006 | 0.007 |
| 881 | 0.027 | 0.884 | 0.058 | 0.007 | 0.01 | 0.01 | 0.006 |
| 882 | 0.019 | 0.924 | 0.007 | 0.012 | 0.006 | 0.018 | 0.014 |
| 883 | 0.015 | 0.928 | 0.009 | 0.016 | 0.007 | 0.016 | 0.01 |
| 884 | 0.011 | 0.939 | 0.009 | 0.012 | 0.013 | 0.011 | 0.006 |
| 885 | 0.013 | 0.946 | 0.014 | 0.01 | 0.005 | 0.007 | 0.005 |
| 886 | 0.004 | 0.976 | 0.005 | 0.005 | 0.003 | 0.004 | 0.003 |
| 887 | 0.003 | 0.004 | 0.97 | 0.006 | 0.005 | 0.006 | 0.006 |
| 888 | 0.003 | 0.005 | 0.976 | 0.006 | 0.003 | 0.003 | 0.004 |
| 889 | 0.004 | 0.006 | 0.962 | 0.012 | 0.006 | 0.006 | 0.004 |
| 890 | 0.006 | 0.747 | 0.221 | 0.006 | 0.008 | 0.007 | 0.006 |
| 891 | 0.055 | 0.752 | 0.011 | 0.052 | 0.032 | 0.07 | 0.028 |
| 892 | 0.036 | 0.04 | 0.746 | 0.012 | 0.064 | 0.062 | 0.04 |
| 893 | 0.008 | 0.123 | 0.482 | 0.306 | 0.059 | 0.014 | 0.008 |
| 894 | 0.004 | 0.013 | 0.952 | 0.006 | 0.008 | 0.008 | 0.009 |
| 895 | 0.003 | 0.005 | 0.965 | 0.006 | 0.006 | 0.007 | 0.009 |
| 896 | 0.002 | 0.004 | 0.973 | 0.006 | 0.006 | 0.005 | 0.004 |
| 897 | 0.002 | 0.004 | 0.977 | 0.004 | 0.005 | 0.004 | 0.004 |
| 898 | 0.003 | 0.004 | 0.977 | 0.004 | 0.004 | 0.004 | 0.005 |
| 899 | 0.007 | 0.487 | 0.333 | 0.042 | 0.016 | 0.016 | 0.098 |
| 900 | 0.013 | 0.04 | 0.876 | 0.009 | 0.008 | 0.016 | 0.038 |
| 901 | 0.042 | 0.036 | 0.036 | 0.86 | 0.006 | 0.012 | 0.008 |
| 902 | 0.249 | 0.422 | 0.032 | 0.196 | 0.016 | 0.074 | 0.01 |
| 903 | 0.08 | 0.726 | 0.017 | 0.108 | 0.013 | 0.032 | 0.025 |
| 904 | 0.002 | 0.003 | 0.979 | 0.005 | 0.003 | 0.003 | 0.004 |
| 905 | 0.021 | 0.16 | 0.155 | 0.057 | 0.329 | 0.254 | 0.025 |
| 906 | 0.021 | 0.099 | 0.689 | 0.071 | 0.004 | 0.01 | 0.105 |
| 907 | 0.007 | 0.844 | 0.095 | 0.023 | 0.014 | 0.011 | 0.007 |
| 908 | 0.002 | 0.004 | 0.981 | 0.004 | 0.003 | 0.003 | 0.003 |
| 909 | 0.006 | 0.007 | 0.928 | 0.034 | 0.007 | 0.01 | 0.008 |
| 910 | 0.003 | 0.003 | 0.974 | 0.004 | 0.005 | 0.005 | 0.007 |
| 911 | 0.008 | 0.764 | 0.18 | 0.031 | 0.007 | 0.005 | 0.004 |
| 912 | 0.13 | 0.453 | 0.171 | 0.045 | 0.014 | 0.017 | 0.17 |
| 913 | 0.009 | 0.898 | 0.018 | 0.012 | 0.036 | 0.017 | 0.01 |
| 914 | 0.01 | 0.888 | 0.011 | 0.046 | 0.022 | 0.018 | 0.006 |
| 915 | 0.027 | 0.908 | 0.009 | 0.015 | 0.008 | 0.016 | 0.017 |
| 916 | 0.008 | 0.891 | 0.034 | 0.021 | 0.009 | 0.014 | 0.022 |
| 917 | 0.007 | 0.893 | 0.047 | 0.018 | 0.016 | 0.011 | 0.008 |
| 918 | 0.011 | 0.925 | 0.007 | 0.023 | 0.023 | 0.006 | 0.004 |
| 919 | 0.013 | 0.908 | 0.011 | 0.033 | 0.021 | 0.01 | 0.004 |
| 920 | 0.025 | 0.953 | 0.006 | 0.005 | 0.004 | 0.005 | 0.003 |
| 921 | 0.02 | 0.886 | 0.024 | 0.012 | 0.023 | 0.031 | 0.005 |
| 922 | 0.009 | 0.299 | 0.341 | 0.293 | 0.037 | 0.014 | 0.007 |
| 923 | 0.106 | 0.861 | 0.014 | 0.006 | 0.004 | 0.006 | 0.004 |
| 924 | 0.007 | 0.879 | 0.026 | 0.018 | 0.035 | 0.028 | 0.008 |
| 925 | 0.016 | 0.835 | 0.033 | 0.097 | 0.008 | 0.006 | 0.005 |
| 926 | 0.016 | 0.84 | 0.05 | 0.028 | 0.037 | 0.012 | 0.016 |
| 927 | 0.021 | 0.017 | 0.011 | 0.853 | 0.074 | 0.02 | 0.004 |
| 928 | 0.009 | 0.913 | 0.04 | 0.022 | 0.005 | 0.007 | 0.003 |
| 929 | 0.004 | 0.931 | 0.033 | 0.015 | 0.008 | 0.005 | 0.004 |
| 930 | 0.04 | 0.933 | 0.005 | 0.005 | 0.004 | 0.005 | 0.008 |
| 931 | 0.011 | 0.79 | 0.042 | 0.036 | 0.017 | 0.073 | 0.03 |
| 932 | 0.142 | 0.811 | 0.02 | 0.013 | 0.004 | 0.005 | 0.004 |
| 933 | 0.004 | 0.624 | 0.016 | 0.038 | 0.029 | 0.203 | 0.086 |
| 934 | 0.024 | 0.927 | 0.024 | 0.007 | 0.009 | 0.006 | 0.004 |
| 935 | 0.088 | 0.042 | 0.208 | 0.142 | 0.072 | 0.397 | 0.052 |
| 936 | 0.015 | 0.009 | 0.013 | 0.014 | 0.916 | 0.021 | 0.011 |
| 937 | 0.004 | 0.004 | 0.004 | 0.005 | 0.946 | 0.023 | 0.014 |
| 938 | 0.018 | 0.076 | 0.056 | 0.019 | 0.777 | 0.033 | 0.021 |
| 939 | 0.005 | 0.046 | 0.031 | 0.061 | 0.663 | 0.175 | 0.019 |
| 940 | 0.005 | 0.007 | 0.037 | 0.012 | 0.919 | 0.008 | 0.012 |
| 941 | 0.006 | 0.004 | 0.004 | 0.003 | 0.968 | 0.011 | 0.003 |
| 942 | 0.078 | 0.013 | 0.031 | 0.512 | 0.116 | 0.243 | 0.006 |
| 943 | 0.008 | 0.133 | 0.006 | 0.011 | 0.825 | 0.01 | 0.007 |
| 944 | 0.036 | 0.02 | 0.01 | 0.047 | 0.776 | 0.094 | 0.017 |
| 945 | 0.038 | 0.86 | 0.024 | 0.048 | 0.004 | 0.01 | 0.016 |
| 946 | 0.013 | 0.026 | 0.017 | 0.029 | 0.796 | 0.108 | 0.012 |
| 947 | 0.012 | 0.07 | 0.519 | 0.04 | 0.135 | 0.214 | 0.011 |
| 948 | 0.004 | 0.964 | 0.009 | 0.006 | 0.005 | 0.006 | 0.006 |
| 949 | 0.004 | 0.902 | 0.057 | 0.011 | 0.009 | 0.01 | 0.006 |
| 950 | 0.007 | 0.231 | 0.021 | 0.046 | 0.61 | 0.081 | 0.004 |
| 951 | 0.006 | 0.003 | 0.005 | 0.007 | 0.934 | 0.006 | 0.039 |
| 952 | 0.005 | 0.029 | 0.011 | 0.011 | 0.899 | 0.041 | 0.004 |
| 953 | 0.008 | 0.358 | 0.475 | 0.052 | 0.024 | 0.051 | 0.033 |
| 954 | 0.01 | 0.042 | 0.018 | 0.031 | 0.542 | 0.221 | 0.135 |
| 955 | 0.005 | 0.018 | 0.012 | 0.007 | 0.893 | 0.057 | 0.007 |
| 956 | 0.037 | 0.013 | 0.006 | 0.011 | 0.827 | 0.09 | 0.015 |
| 957 | 0.005 | 0.004 | 0.006 | 0.005 | 0.959 | 0.014 | 0.007 |
| 958 | 0.007 | 0.015 | 0.015 | 0.028 | 0.129 | 0.624 | 0.183 |
| 959 | 0.003 | 0.004 | 0.004 | 0.006 | 0.006 | 0.005 | 0.972 |
| 960 | 0.004 | 0.004 | 0.004 | 0.003 | 0.004 | 0.004 | 0.977 |
| 961 | 0.006 | 0.005 | 0.004 | 0.004 | 0.005 | 0.006 | 0.97 |
| 962 | 0.006 | 0.004 | 0.006 | 0.004 | 0.007 | 0.005 | 0.968 |
| 963 | 0.006 | 0.007 | 0.058 | 0.014 | 0.025 | 0.009 | 0.88 |
| 964 | 0.007 | 0.005 | 0.005 | 0.005 | 0.005 | 0.009 | 0.965 |
| 965 | 0.004 | 0.003 | 0.004 | 0.006 | 0.005 | 0.004 | 0.974 |
| 966 | 0.003 | 0.002 | 0.004 | 0.003 | 0.004 | 0.004 | 0.981 |
| 967 | 0.008 | 0.005 | 0.024 | 0.012 | 0.01 | 0.006 | 0.934 |
| 968 | 0.008 | 0.004 | 0.005 | 0.007 | 0.005 | 0.009 | 0.962 |
| 969 | 0.042 | 0.029 | 0.009 | 0.007 | 0.005 | 0.016 | 0.892 |
| 970 | 0.009 | 0.004 | 0.004 | 0.005 | 0.018 | 0.007 | 0.953 |
| 971 | 0.006 | 0.011 | 0.01 | 0.008 | 0.09 | 0.377 | 0.499 |
| 972 | 0.015 | 0.027 | 0.034 | 0.007 | 0.011 | 0.014 | 0.891 |
| 973 | 0.007 | 0.007 | 0.017 | 0.015 | 0.014 | 0.01 | 0.93 |
| 974 | 0.007 | 0.009 | 0.012 | 0.005 | 0.007 | 0.007 | 0.952 |
| 975 | 0.006 | 0.006 | 0.007 | 0.006 | 0.006 | 0.007 | 0.962 |
| 976 | 0.004 | 0.007 | 0.006 | 0.005 | 0.023 | 0.012 | 0.943 |
| 977 | 0.035 | 0.004 | 0.005 | 0.004 | 0.03 | 0.008 | 0.914 |
| 978 | 0.012 | 0.01 | 0.005 | 0.005 | 0.007 | 0.011 | 0.95 |
| 979 | 0.005 | 0.007 | 0.009 | 0.013 | 0.018 | 0.017 | 0.932 |
| 980 | 0.006 | 0.005 | 0.028 | 0.009 | 0.015 | 0.009 | 0.93 |
| 981 | 0.003 | 0.003 | 0.003 | 0.003 | 0.006 | 0.007 | 0.975 |
| 982 | 0.008 | 0.005 | 0.004 | 0.004 | 0.005 | 0.005 | 0.97 |
| 983 | 0.012 | 0.007 | 0.012 | 0.007 | 0.931 | 0.019 | 0.012 |
| 984 | 0.005 | 0.004 | 0.008 | 0.009 | 0.023 | 0.022 | 0.929 |
| 985 | 0.008 | 0.005 | 0.01 | 0.005 | 0.008 | 0.009 | 0.955 |
| 986 | 0.008 | 0.004 | 0.009 | 0.004 | 0.005 | 0.007 | 0.964 |
| 987 | 0.003 | 0.007 | 0.062 | 0.005 | 0.01 | 0.006 | 0.907 |
| 988 | 0.005 | 0.004 | 0.008 | 0.004 | 0.006 | 0.008 | 0.966 |
| 989 | 0.008 | 0.006 | 0.007 | 0.005 | 0.008 | 0.019 | 0.948 |
| 990 | 0.007 | 0.028 | 0.032 | 0.019 | 0.013 | 0.011 | 0.89 |
| 991 | 0.004 | 0.01 | 0.079 | 0.013 | 0.014 | 0.013 | 0.867 |
| 992 | 0.005 | 0.011 | 0.175 | 0.022 | 0.006 | 0.008 | 0.772 |
| 993 | 0.008 | 0.005 | 0.015 | 0.015 | 0.044 | 0.051 | 0.862 |
| 994 | 0.01 | 0.003 | 0.018 | 0.008 | 0.014 | 0.225 | 0.722 |
| 995 | 0.012 | 0.018 | 0.079 | 0.033 | 0.017 | 0.063 | 0.778 |
| 996 | 0.009 | 0.005 | 0.005 | 0.007 | 0.01 | 0.012 | 0.953 |
| 997 | 0.005 | 0.004 | 0.011 | 0.006 | 0.013 | 0.007 | 0.953 |
| 998 | 0.018 | 0.009 | 0.027 | 0.023 | 0.013 | 0.011 | 0.9 |
| 999 | 0.005 | 0.005 | 0.008 | 0.013 | 0.065 | 0.128 | 0.776 |
| 1000 | 0.014 | 0.005 | 0.021 | 0.007 | 0.018 | 0.155 | 0.78 |
| 1001 | 0.003 | 0.004 | 0.006 | 0.006 | 0.009 | 0.016 | 0.958 |
| 1002 | 0.003 | 0.003 | 0.004 | 0.004 | 0.005 | 0.006 | 0.976 |
| 1003 | 0.004 | 0.004 | 0.005 | 0.004 | 0.004 | 0.007 | 0.974 |
| 1004 | 0.005 | 0.008 | 0.014 | 0.027 | 0.02 | 0.04 | 0.886 |
| 1005 | 0.005 | 0.005 | 0.005 | 0.009 | 0.019 | 0.02 | 0.937 |
| 1006 | 0.013 | 0.013 | 0.007 | 0.014 | 0.015 | 0.016 | 0.921 |
| 1007 | 0.005 | 0.003 | 0.006 | 0.005 | 0.008 | 0.011 | 0.963 |
| 1008 | 0.028 | 0.007 | 0.033 | 0.02 | 0.007 | 0.2 | 0.706 |
| 1009 | 0.008 | 0.009 | 0.006 | 0.006 | 0.018 | 0.025 | 0.928 |
| 1010 | 0.009 | 0.017 | 0.008 | 0.361 | 0.026 | 0.109 | 0.47 |
| 1011 | 0.01 | 0.02 | 0.005 | 0.021 | 0.139 | 0.041 | 0.764 |
| 1012 | 0.006 | 0.009 | 0.008 | 0.054 | 0.017 | 0.053 | 0.852 |
| 1013 | 0.005 | 0.006 | 0.007 | 0.007 | 0.005 | 0.007 | 0.963 |
| 1014 | 0.005 | 0.004 | 0.004 | 0.006 | 0.007 | 0.007 | 0.967 |
| 1015 | 0.01 | 0.013 | 0.026 | 0.185 | 0.007 | 0.027 | 0.732 |
| 1016 | 0.004 | 0.007 | 0.006 | 0.013 | 0.03 | 0.024 | 0.916 |
| 1017 | 0.006 | 0.005 | 0.007 | 0.004 | 0.007 | 0.009 | 0.963 |
| 1018 | 0.009 | 0.018 | 0.009 | 0.023 | 0.017 | 0.014 | 0.91 |
| 1019 | 0.007 | 0.007 | 0.008 | 0.023 | 0.012 | 0.018 | 0.926 |
| 1020 | 0.047 | 0.018 | 0.037 | 0.018 | 0.007 | 0.008 | 0.865 |
| 1021 | 0.009 | 0.011 | 0.035 | 0.021 | 0.01 | 0.017 | 0.897 |
| 1022 | 0.003 | 0.013 | 0.025 | 0.012 | 0.021 | 0.022 | 0.904 |
| 1023 | 0.008 | 0.014 | 0.011 | 0.012 | 0.02 | 0.013 | 0.922 |
| 1024 | 0.003 | 0.004 | 0.005 | 0.004 | 0.004 | 0.007 | 0.973 |
| 1025 | 0.003 | 0.021 | 0.043 | 0.037 | 0.022 | 0.083 | 0.792 |
| 1026 | 0.005 | 0.004 | 0.011 | 0.005 | 0.007 | 0.009 | 0.96 |